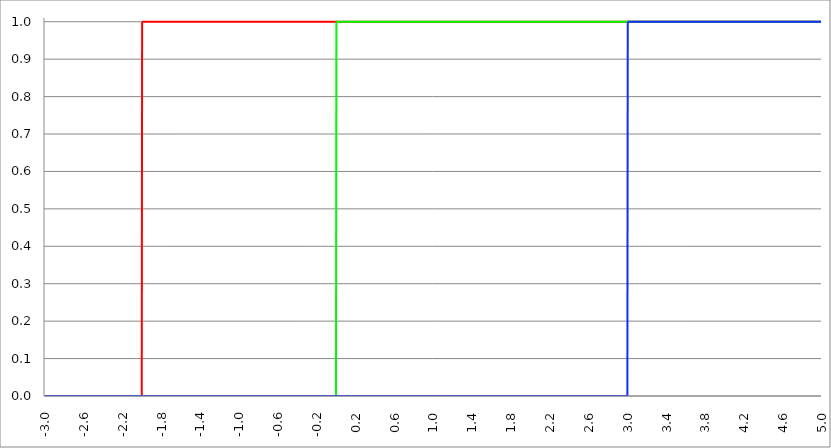
| Category | Series 1 | Series 0 | Series 2 |
|---|---|---|---|
| -3.0 | 0 | 0 | 0 |
| -2.996 | 0 | 0 | 0 |
| -2.992 | 0 | 0 | 0 |
| -2.988 | 0 | 0 | 0 |
| -2.984 | 0 | 0 | 0 |
| -2.98 | 0 | 0 | 0 |
| -2.976 | 0 | 0 | 0 |
| -2.972 | 0 | 0 | 0 |
| -2.968 | 0 | 0 | 0 |
| -2.964 | 0 | 0 | 0 |
| -2.96 | 0 | 0 | 0 |
| -2.956 | 0 | 0 | 0 |
| -2.952 | 0 | 0 | 0 |
| -2.948 | 0 | 0 | 0 |
| -2.944 | 0 | 0 | 0 |
| -2.94 | 0 | 0 | 0 |
| -2.936 | 0 | 0 | 0 |
| -2.932 | 0 | 0 | 0 |
| -2.928 | 0 | 0 | 0 |
| -2.924 | 0 | 0 | 0 |
| -2.92 | 0 | 0 | 0 |
| -2.916 | 0 | 0 | 0 |
| -2.912 | 0 | 0 | 0 |
| -2.908 | 0 | 0 | 0 |
| -2.904 | 0 | 0 | 0 |
| -2.9 | 0 | 0 | 0 |
| -2.896 | 0 | 0 | 0 |
| -2.892 | 0 | 0 | 0 |
| -2.888 | 0 | 0 | 0 |
| -2.884 | 0 | 0 | 0 |
| -2.88 | 0 | 0 | 0 |
| -2.876 | 0 | 0 | 0 |
| -2.872 | 0 | 0 | 0 |
| -2.868 | 0 | 0 | 0 |
| -2.864 | 0 | 0 | 0 |
| -2.86 | 0 | 0 | 0 |
| -2.856 | 0 | 0 | 0 |
| -2.852 | 0 | 0 | 0 |
| -2.848 | 0 | 0 | 0 |
| -2.844 | 0 | 0 | 0 |
| -2.84 | 0 | 0 | 0 |
| -2.836 | 0 | 0 | 0 |
| -2.832 | 0 | 0 | 0 |
| -2.828 | 0 | 0 | 0 |
| -2.824 | 0 | 0 | 0 |
| -2.82 | 0 | 0 | 0 |
| -2.816 | 0 | 0 | 0 |
| -2.812 | 0 | 0 | 0 |
| -2.808 | 0 | 0 | 0 |
| -2.804 | 0 | 0 | 0 |
| -2.8 | 0 | 0 | 0 |
| -2.796 | 0 | 0 | 0 |
| -2.792 | 0 | 0 | 0 |
| -2.788 | 0 | 0 | 0 |
| -2.784 | 0 | 0 | 0 |
| -2.78 | 0 | 0 | 0 |
| -2.776 | 0 | 0 | 0 |
| -2.772 | 0 | 0 | 0 |
| -2.768 | 0 | 0 | 0 |
| -2.764 | 0 | 0 | 0 |
| -2.76 | 0 | 0 | 0 |
| -2.756 | 0 | 0 | 0 |
| -2.752 | 0 | 0 | 0 |
| -2.748 | 0 | 0 | 0 |
| -2.744 | 0 | 0 | 0 |
| -2.74 | 0 | 0 | 0 |
| -2.736 | 0 | 0 | 0 |
| -2.732 | 0 | 0 | 0 |
| -2.728 | 0 | 0 | 0 |
| -2.724 | 0 | 0 | 0 |
| -2.72 | 0 | 0 | 0 |
| -2.716 | 0 | 0 | 0 |
| -2.712 | 0 | 0 | 0 |
| -2.708 | 0 | 0 | 0 |
| -2.704 | 0 | 0 | 0 |
| -2.7 | 0 | 0 | 0 |
| -2.696 | 0 | 0 | 0 |
| -2.692 | 0 | 0 | 0 |
| -2.688 | 0 | 0 | 0 |
| -2.684 | 0 | 0 | 0 |
| -2.68 | 0 | 0 | 0 |
| -2.676 | 0 | 0 | 0 |
| -2.672 | 0 | 0 | 0 |
| -2.668 | 0 | 0 | 0 |
| -2.664 | 0 | 0 | 0 |
| -2.66 | 0 | 0 | 0 |
| -2.656 | 0 | 0 | 0 |
| -2.652 | 0 | 0 | 0 |
| -2.648 | 0 | 0 | 0 |
| -2.644 | 0 | 0 | 0 |
| -2.64 | 0 | 0 | 0 |
| -2.636 | 0 | 0 | 0 |
| -2.632 | 0 | 0 | 0 |
| -2.628 | 0 | 0 | 0 |
| -2.624 | 0 | 0 | 0 |
| -2.62 | 0 | 0 | 0 |
| -2.616 | 0 | 0 | 0 |
| -2.612 | 0 | 0 | 0 |
| -2.608 | 0 | 0 | 0 |
| -2.604 | 0 | 0 | 0 |
| -2.6 | 0 | 0 | 0 |
| -2.596 | 0 | 0 | 0 |
| -2.592 | 0 | 0 | 0 |
| -2.588 | 0 | 0 | 0 |
| -2.584 | 0 | 0 | 0 |
| -2.58 | 0 | 0 | 0 |
| -2.576 | 0 | 0 | 0 |
| -2.572 | 0 | 0 | 0 |
| -2.568 | 0 | 0 | 0 |
| -2.564 | 0 | 0 | 0 |
| -2.56 | 0 | 0 | 0 |
| -2.556 | 0 | 0 | 0 |
| -2.552 | 0 | 0 | 0 |
| -2.548 | 0 | 0 | 0 |
| -2.544 | 0 | 0 | 0 |
| -2.54 | 0 | 0 | 0 |
| -2.536 | 0 | 0 | 0 |
| -2.532 | 0 | 0 | 0 |
| -2.528 | 0 | 0 | 0 |
| -2.524 | 0 | 0 | 0 |
| -2.52 | 0 | 0 | 0 |
| -2.516 | 0 | 0 | 0 |
| -2.512 | 0 | 0 | 0 |
| -2.508 | 0 | 0 | 0 |
| -2.504 | 0 | 0 | 0 |
| -2.5 | 0 | 0 | 0 |
| -2.496 | 0 | 0 | 0 |
| -2.492 | 0 | 0 | 0 |
| -2.488 | 0 | 0 | 0 |
| -2.484 | 0 | 0 | 0 |
| -2.48 | 0 | 0 | 0 |
| -2.476 | 0 | 0 | 0 |
| -2.472 | 0 | 0 | 0 |
| -2.467999999999999 | 0 | 0 | 0 |
| -2.463999999999999 | 0 | 0 | 0 |
| -2.459999999999999 | 0 | 0 | 0 |
| -2.455999999999999 | 0 | 0 | 0 |
| -2.451999999999999 | 0 | 0 | 0 |
| -2.447999999999999 | 0 | 0 | 0 |
| -2.443999999999999 | 0 | 0 | 0 |
| -2.439999999999999 | 0 | 0 | 0 |
| -2.435999999999999 | 0 | 0 | 0 |
| -2.431999999999999 | 0 | 0 | 0 |
| -2.427999999999999 | 0 | 0 | 0 |
| -2.423999999999999 | 0 | 0 | 0 |
| -2.419999999999999 | 0 | 0 | 0 |
| -2.415999999999999 | 0 | 0 | 0 |
| -2.411999999999999 | 0 | 0 | 0 |
| -2.407999999999999 | 0 | 0 | 0 |
| -2.403999999999999 | 0 | 0 | 0 |
| -2.399999999999999 | 0 | 0 | 0 |
| -2.395999999999999 | 0 | 0 | 0 |
| -2.391999999999999 | 0 | 0 | 0 |
| -2.387999999999999 | 0 | 0 | 0 |
| -2.383999999999999 | 0 | 0 | 0 |
| -2.379999999999999 | 0 | 0 | 0 |
| -2.375999999999999 | 0 | 0 | 0 |
| -2.371999999999999 | 0 | 0 | 0 |
| -2.367999999999999 | 0 | 0 | 0 |
| -2.363999999999999 | 0 | 0 | 0 |
| -2.359999999999999 | 0 | 0 | 0 |
| -2.355999999999999 | 0 | 0 | 0 |
| -2.351999999999999 | 0 | 0 | 0 |
| -2.347999999999999 | 0 | 0 | 0 |
| -2.343999999999999 | 0 | 0 | 0 |
| -2.339999999999999 | 0 | 0 | 0 |
| -2.335999999999999 | 0 | 0 | 0 |
| -2.331999999999999 | 0 | 0 | 0 |
| -2.327999999999999 | 0 | 0 | 0 |
| -2.323999999999999 | 0 | 0 | 0 |
| -2.319999999999999 | 0 | 0 | 0 |
| -2.315999999999999 | 0 | 0 | 0 |
| -2.311999999999999 | 0 | 0 | 0 |
| -2.307999999999999 | 0 | 0 | 0 |
| -2.303999999999999 | 0 | 0 | 0 |
| -2.299999999999999 | 0 | 0 | 0 |
| -2.295999999999999 | 0 | 0 | 0 |
| -2.291999999999999 | 0 | 0 | 0 |
| -2.288 | 0 | 0 | 0 |
| -2.284 | 0 | 0 | 0 |
| -2.279999999999999 | 0 | 0 | 0 |
| -2.275999999999999 | 0 | 0 | 0 |
| -2.271999999999999 | 0 | 0 | 0 |
| -2.268 | 0 | 0 | 0 |
| -2.264 | 0 | 0 | 0 |
| -2.259999999999999 | 0 | 0 | 0 |
| -2.255999999999999 | 0 | 0 | 0 |
| -2.251999999999999 | 0 | 0 | 0 |
| -2.248 | 0 | 0 | 0 |
| -2.244 | 0 | 0 | 0 |
| -2.239999999999999 | 0 | 0 | 0 |
| -2.235999999999999 | 0 | 0 | 0 |
| -2.231999999999999 | 0 | 0 | 0 |
| -2.228 | 0 | 0 | 0 |
| -2.224 | 0 | 0 | 0 |
| -2.219999999999999 | 0 | 0 | 0 |
| -2.215999999999999 | 0 | 0 | 0 |
| -2.211999999999999 | 0 | 0 | 0 |
| -2.208 | 0 | 0 | 0 |
| -2.204 | 0 | 0 | 0 |
| -2.199999999999999 | 0 | 0 | 0 |
| -2.195999999999999 | 0 | 0 | 0 |
| -2.191999999999999 | 0 | 0 | 0 |
| -2.188 | 0 | 0 | 0 |
| -2.184 | 0 | 0 | 0 |
| -2.179999999999999 | 0 | 0 | 0 |
| -2.175999999999999 | 0 | 0 | 0 |
| -2.171999999999999 | 0 | 0 | 0 |
| -2.168 | 0 | 0 | 0 |
| -2.164 | 0 | 0 | 0 |
| -2.159999999999999 | 0 | 0 | 0 |
| -2.155999999999999 | 0 | 0 | 0 |
| -2.151999999999999 | 0 | 0 | 0 |
| -2.148 | 0 | 0 | 0 |
| -2.144 | 0 | 0 | 0 |
| -2.139999999999999 | 0 | 0 | 0 |
| -2.135999999999999 | 0 | 0 | 0 |
| -2.131999999999999 | 0 | 0 | 0 |
| -2.128 | 0 | 0 | 0 |
| -2.124 | 0 | 0 | 0 |
| -2.119999999999999 | 0 | 0 | 0 |
| -2.115999999999999 | 0 | 0 | 0 |
| -2.111999999999999 | 0 | 0 | 0 |
| -2.108 | 0 | 0 | 0 |
| -2.104 | 0 | 0 | 0 |
| -2.099999999999999 | 0 | 0 | 0 |
| -2.095999999999999 | 0 | 0 | 0 |
| -2.091999999999999 | 0 | 0 | 0 |
| -2.088 | 0 | 0 | 0 |
| -2.084 | 0 | 0 | 0 |
| -2.079999999999999 | 0 | 0 | 0 |
| -2.075999999999999 | 0 | 0 | 0 |
| -2.071999999999999 | 0 | 0 | 0 |
| -2.068 | 0 | 0 | 0 |
| -2.064 | 0 | 0 | 0 |
| -2.059999999999999 | 0 | 0 | 0 |
| -2.055999999999999 | 0 | 0 | 0 |
| -2.051999999999999 | 0 | 0 | 0 |
| -2.048 | 0 | 0 | 0 |
| -2.044 | 0 | 0 | 0 |
| -2.039999999999999 | 0 | 0 | 0 |
| -2.035999999999999 | 0 | 0 | 0 |
| -2.031999999999999 | 0 | 0 | 0 |
| -2.028 | 0 | 0 | 0 |
| -2.024 | 0 | 0 | 0 |
| -2.019999999999999 | 0 | 0 | 0 |
| -2.015999999999999 | 0 | 0 | 0 |
| -2.011999999999999 | 0 | 0 | 0 |
| -2.008 | 0 | 0 | 0 |
| -2.004 | 0 | 0 | 0 |
| -1.999999999999999 | 1 | 0 | 0 |
| -1.995999999999999 | 1 | 0 | 0 |
| -1.991999999999999 | 1 | 0 | 0 |
| -1.987999999999999 | 1 | 0 | 0 |
| -1.983999999999999 | 1 | 0 | 0 |
| -1.979999999999999 | 1 | 0 | 0 |
| -1.975999999999999 | 1 | 0 | 0 |
| -1.971999999999999 | 1 | 0 | 0 |
| -1.967999999999999 | 1 | 0 | 0 |
| -1.963999999999999 | 1 | 0 | 0 |
| -1.959999999999999 | 1 | 0 | 0 |
| -1.955999999999999 | 1 | 0 | 0 |
| -1.951999999999999 | 1 | 0 | 0 |
| -1.947999999999999 | 1 | 0 | 0 |
| -1.943999999999999 | 1 | 0 | 0 |
| -1.939999999999999 | 1 | 0 | 0 |
| -1.935999999999999 | 1 | 0 | 0 |
| -1.931999999999999 | 1 | 0 | 0 |
| -1.927999999999999 | 1 | 0 | 0 |
| -1.923999999999999 | 1 | 0 | 0 |
| -1.919999999999999 | 1 | 0 | 0 |
| -1.915999999999999 | 1 | 0 | 0 |
| -1.911999999999999 | 1 | 0 | 0 |
| -1.907999999999999 | 1 | 0 | 0 |
| -1.903999999999999 | 1 | 0 | 0 |
| -1.899999999999999 | 1 | 0 | 0 |
| -1.895999999999999 | 1 | 0 | 0 |
| -1.891999999999999 | 1 | 0 | 0 |
| -1.887999999999999 | 1 | 0 | 0 |
| -1.883999999999999 | 1 | 0 | 0 |
| -1.879999999999999 | 1 | 0 | 0 |
| -1.875999999999999 | 1 | 0 | 0 |
| -1.871999999999999 | 1 | 0 | 0 |
| -1.867999999999999 | 1 | 0 | 0 |
| -1.863999999999999 | 1 | 0 | 0 |
| -1.859999999999999 | 1 | 0 | 0 |
| -1.855999999999999 | 1 | 0 | 0 |
| -1.851999999999999 | 1 | 0 | 0 |
| -1.847999999999999 | 1 | 0 | 0 |
| -1.843999999999999 | 1 | 0 | 0 |
| -1.839999999999999 | 1 | 0 | 0 |
| -1.835999999999999 | 1 | 0 | 0 |
| -1.831999999999999 | 1 | 0 | 0 |
| -1.827999999999999 | 1 | 0 | 0 |
| -1.823999999999999 | 1 | 0 | 0 |
| -1.819999999999999 | 1 | 0 | 0 |
| -1.815999999999999 | 1 | 0 | 0 |
| -1.811999999999999 | 1 | 0 | 0 |
| -1.807999999999999 | 1 | 0 | 0 |
| -1.803999999999999 | 1 | 0 | 0 |
| -1.799999999999999 | 1 | 0 | 0 |
| -1.795999999999999 | 1 | 0 | 0 |
| -1.791999999999999 | 1 | 0 | 0 |
| -1.787999999999999 | 1 | 0 | 0 |
| -1.783999999999999 | 1 | 0 | 0 |
| -1.779999999999999 | 1 | 0 | 0 |
| -1.775999999999999 | 1 | 0 | 0 |
| -1.771999999999999 | 1 | 0 | 0 |
| -1.767999999999999 | 1 | 0 | 0 |
| -1.763999999999999 | 1 | 0 | 0 |
| -1.759999999999999 | 1 | 0 | 0 |
| -1.755999999999999 | 1 | 0 | 0 |
| -1.751999999999999 | 1 | 0 | 0 |
| -1.747999999999999 | 1 | 0 | 0 |
| -1.743999999999999 | 1 | 0 | 0 |
| -1.739999999999999 | 1 | 0 | 0 |
| -1.735999999999999 | 1 | 0 | 0 |
| -1.731999999999999 | 1 | 0 | 0 |
| -1.727999999999999 | 1 | 0 | 0 |
| -1.723999999999999 | 1 | 0 | 0 |
| -1.719999999999999 | 1 | 0 | 0 |
| -1.715999999999999 | 1 | 0 | 0 |
| -1.711999999999999 | 1 | 0 | 0 |
| -1.707999999999999 | 1 | 0 | 0 |
| -1.703999999999999 | 1 | 0 | 0 |
| -1.699999999999999 | 1 | 0 | 0 |
| -1.695999999999999 | 1 | 0 | 0 |
| -1.691999999999999 | 1 | 0 | 0 |
| -1.687999999999999 | 1 | 0 | 0 |
| -1.683999999999999 | 1 | 0 | 0 |
| -1.679999999999999 | 1 | 0 | 0 |
| -1.675999999999999 | 1 | 0 | 0 |
| -1.671999999999999 | 1 | 0 | 0 |
| -1.667999999999999 | 1 | 0 | 0 |
| -1.663999999999999 | 1 | 0 | 0 |
| -1.659999999999999 | 1 | 0 | 0 |
| -1.655999999999999 | 1 | 0 | 0 |
| -1.651999999999999 | 1 | 0 | 0 |
| -1.647999999999999 | 1 | 0 | 0 |
| -1.643999999999999 | 1 | 0 | 0 |
| -1.639999999999999 | 1 | 0 | 0 |
| -1.635999999999999 | 1 | 0 | 0 |
| -1.631999999999999 | 1 | 0 | 0 |
| -1.627999999999999 | 1 | 0 | 0 |
| -1.623999999999999 | 1 | 0 | 0 |
| -1.619999999999999 | 1 | 0 | 0 |
| -1.615999999999999 | 1 | 0 | 0 |
| -1.611999999999999 | 1 | 0 | 0 |
| -1.607999999999999 | 1 | 0 | 0 |
| -1.603999999999999 | 1 | 0 | 0 |
| -1.599999999999999 | 1 | 0 | 0 |
| -1.595999999999999 | 1 | 0 | 0 |
| -1.591999999999999 | 1 | 0 | 0 |
| -1.587999999999999 | 1 | 0 | 0 |
| -1.583999999999999 | 1 | 0 | 0 |
| -1.579999999999999 | 1 | 0 | 0 |
| -1.575999999999999 | 1 | 0 | 0 |
| -1.571999999999999 | 1 | 0 | 0 |
| -1.567999999999999 | 1 | 0 | 0 |
| -1.563999999999999 | 1 | 0 | 0 |
| -1.559999999999999 | 1 | 0 | 0 |
| -1.555999999999999 | 1 | 0 | 0 |
| -1.551999999999999 | 1 | 0 | 0 |
| -1.547999999999999 | 1 | 0 | 0 |
| -1.543999999999999 | 1 | 0 | 0 |
| -1.539999999999999 | 1 | 0 | 0 |
| -1.535999999999999 | 1 | 0 | 0 |
| -1.531999999999999 | 1 | 0 | 0 |
| -1.527999999999999 | 1 | 0 | 0 |
| -1.523999999999999 | 1 | 0 | 0 |
| -1.519999999999999 | 1 | 0 | 0 |
| -1.515999999999999 | 1 | 0 | 0 |
| -1.511999999999999 | 1 | 0 | 0 |
| -1.507999999999999 | 1 | 0 | 0 |
| -1.503999999999999 | 1 | 0 | 0 |
| -1.499999999999999 | 1 | 0 | 0 |
| -1.495999999999999 | 1 | 0 | 0 |
| -1.491999999999999 | 1 | 0 | 0 |
| -1.487999999999999 | 1 | 0 | 0 |
| -1.483999999999999 | 1 | 0 | 0 |
| -1.479999999999999 | 1 | 0 | 0 |
| -1.475999999999999 | 1 | 0 | 0 |
| -1.471999999999999 | 1 | 0 | 0 |
| -1.467999999999999 | 1 | 0 | 0 |
| -1.463999999999999 | 1 | 0 | 0 |
| -1.459999999999999 | 1 | 0 | 0 |
| -1.455999999999999 | 1 | 0 | 0 |
| -1.451999999999999 | 1 | 0 | 0 |
| -1.447999999999999 | 1 | 0 | 0 |
| -1.443999999999999 | 1 | 0 | 0 |
| -1.439999999999999 | 1 | 0 | 0 |
| -1.435999999999999 | 1 | 0 | 0 |
| -1.431999999999999 | 1 | 0 | 0 |
| -1.427999999999999 | 1 | 0 | 0 |
| -1.423999999999999 | 1 | 0 | 0 |
| -1.419999999999999 | 1 | 0 | 0 |
| -1.415999999999999 | 1 | 0 | 0 |
| -1.411999999999999 | 1 | 0 | 0 |
| -1.407999999999999 | 1 | 0 | 0 |
| -1.403999999999999 | 1 | 0 | 0 |
| -1.399999999999999 | 1 | 0 | 0 |
| -1.395999999999999 | 1 | 0 | 0 |
| -1.391999999999999 | 1 | 0 | 0 |
| -1.387999999999999 | 1 | 0 | 0 |
| -1.383999999999999 | 1 | 0 | 0 |
| -1.379999999999999 | 1 | 0 | 0 |
| -1.375999999999999 | 1 | 0 | 0 |
| -1.371999999999999 | 1 | 0 | 0 |
| -1.367999999999998 | 1 | 0 | 0 |
| -1.363999999999998 | 1 | 0 | 0 |
| -1.359999999999998 | 1 | 0 | 0 |
| -1.355999999999998 | 1 | 0 | 0 |
| -1.351999999999998 | 1 | 0 | 0 |
| -1.347999999999998 | 1 | 0 | 0 |
| -1.343999999999998 | 1 | 0 | 0 |
| -1.339999999999998 | 1 | 0 | 0 |
| -1.335999999999998 | 1 | 0 | 0 |
| -1.331999999999998 | 1 | 0 | 0 |
| -1.327999999999998 | 1 | 0 | 0 |
| -1.323999999999998 | 1 | 0 | 0 |
| -1.319999999999998 | 1 | 0 | 0 |
| -1.315999999999998 | 1 | 0 | 0 |
| -1.311999999999998 | 1 | 0 | 0 |
| -1.307999999999998 | 1 | 0 | 0 |
| -1.303999999999998 | 1 | 0 | 0 |
| -1.299999999999998 | 1 | 0 | 0 |
| -1.295999999999998 | 1 | 0 | 0 |
| -1.291999999999998 | 1 | 0 | 0 |
| -1.287999999999998 | 1 | 0 | 0 |
| -1.283999999999998 | 1 | 0 | 0 |
| -1.279999999999998 | 1 | 0 | 0 |
| -1.275999999999998 | 1 | 0 | 0 |
| -1.271999999999998 | 1 | 0 | 0 |
| -1.267999999999998 | 1 | 0 | 0 |
| -1.263999999999998 | 1 | 0 | 0 |
| -1.259999999999998 | 1 | 0 | 0 |
| -1.255999999999998 | 1 | 0 | 0 |
| -1.251999999999998 | 1 | 0 | 0 |
| -1.247999999999998 | 1 | 0 | 0 |
| -1.243999999999998 | 1 | 0 | 0 |
| -1.239999999999998 | 1 | 0 | 0 |
| -1.235999999999998 | 1 | 0 | 0 |
| -1.231999999999998 | 1 | 0 | 0 |
| -1.227999999999998 | 1 | 0 | 0 |
| -1.223999999999998 | 1 | 0 | 0 |
| -1.219999999999998 | 1 | 0 | 0 |
| -1.215999999999998 | 1 | 0 | 0 |
| -1.211999999999998 | 1 | 0 | 0 |
| -1.207999999999998 | 1 | 0 | 0 |
| -1.203999999999998 | 1 | 0 | 0 |
| -1.199999999999998 | 1 | 0 | 0 |
| -1.195999999999998 | 1 | 0 | 0 |
| -1.191999999999998 | 1 | 0 | 0 |
| -1.187999999999998 | 1 | 0 | 0 |
| -1.183999999999998 | 1 | 0 | 0 |
| -1.179999999999998 | 1 | 0 | 0 |
| -1.175999999999998 | 1 | 0 | 0 |
| -1.171999999999998 | 1 | 0 | 0 |
| -1.167999999999998 | 1 | 0 | 0 |
| -1.163999999999998 | 1 | 0 | 0 |
| -1.159999999999998 | 1 | 0 | 0 |
| -1.155999999999998 | 1 | 0 | 0 |
| -1.151999999999998 | 1 | 0 | 0 |
| -1.147999999999998 | 1 | 0 | 0 |
| -1.143999999999998 | 1 | 0 | 0 |
| -1.139999999999998 | 1 | 0 | 0 |
| -1.135999999999998 | 1 | 0 | 0 |
| -1.131999999999998 | 1 | 0 | 0 |
| -1.127999999999998 | 1 | 0 | 0 |
| -1.123999999999998 | 1 | 0 | 0 |
| -1.119999999999998 | 1 | 0 | 0 |
| -1.115999999999998 | 1 | 0 | 0 |
| -1.111999999999998 | 1 | 0 | 0 |
| -1.107999999999998 | 1 | 0 | 0 |
| -1.103999999999998 | 1 | 0 | 0 |
| -1.099999999999998 | 1 | 0 | 0 |
| -1.095999999999998 | 1 | 0 | 0 |
| -1.091999999999998 | 1 | 0 | 0 |
| -1.087999999999998 | 1 | 0 | 0 |
| -1.083999999999998 | 1 | 0 | 0 |
| -1.079999999999998 | 1 | 0 | 0 |
| -1.075999999999998 | 1 | 0 | 0 |
| -1.071999999999998 | 1 | 0 | 0 |
| -1.067999999999998 | 1 | 0 | 0 |
| -1.063999999999998 | 1 | 0 | 0 |
| -1.059999999999998 | 1 | 0 | 0 |
| -1.055999999999998 | 1 | 0 | 0 |
| -1.051999999999998 | 1 | 0 | 0 |
| -1.047999999999998 | 1 | 0 | 0 |
| -1.043999999999998 | 1 | 0 | 0 |
| -1.039999999999998 | 1 | 0 | 0 |
| -1.035999999999998 | 1 | 0 | 0 |
| -1.031999999999998 | 1 | 0 | 0 |
| -1.027999999999998 | 1 | 0 | 0 |
| -1.023999999999998 | 1 | 0 | 0 |
| -1.019999999999998 | 1 | 0 | 0 |
| -1.015999999999998 | 1 | 0 | 0 |
| -1.011999999999998 | 1 | 0 | 0 |
| -1.007999999999998 | 1 | 0 | 0 |
| -1.003999999999998 | 1 | 0 | 0 |
| -0.999999999999998 | 1 | 0 | 0 |
| -0.995999999999998 | 1 | 0 | 0 |
| -0.991999999999998 | 1 | 0 | 0 |
| -0.987999999999998 | 1 | 0 | 0 |
| -0.983999999999998 | 1 | 0 | 0 |
| -0.979999999999998 | 1 | 0 | 0 |
| -0.975999999999998 | 1 | 0 | 0 |
| -0.971999999999998 | 1 | 0 | 0 |
| -0.967999999999998 | 1 | 0 | 0 |
| -0.963999999999998 | 1 | 0 | 0 |
| -0.959999999999998 | 1 | 0 | 0 |
| -0.955999999999998 | 1 | 0 | 0 |
| -0.951999999999998 | 1 | 0 | 0 |
| -0.947999999999998 | 1 | 0 | 0 |
| -0.943999999999998 | 1 | 0 | 0 |
| -0.939999999999998 | 1 | 0 | 0 |
| -0.935999999999998 | 1 | 0 | 0 |
| -0.931999999999998 | 1 | 0 | 0 |
| -0.927999999999998 | 1 | 0 | 0 |
| -0.923999999999998 | 1 | 0 | 0 |
| -0.919999999999998 | 1 | 0 | 0 |
| -0.915999999999998 | 1 | 0 | 0 |
| -0.911999999999998 | 1 | 0 | 0 |
| -0.907999999999998 | 1 | 0 | 0 |
| -0.903999999999998 | 1 | 0 | 0 |
| -0.899999999999998 | 1 | 0 | 0 |
| -0.895999999999998 | 1 | 0 | 0 |
| -0.891999999999998 | 1 | 0 | 0 |
| -0.887999999999998 | 1 | 0 | 0 |
| -0.883999999999998 | 1 | 0 | 0 |
| -0.879999999999998 | 1 | 0 | 0 |
| -0.875999999999998 | 1 | 0 | 0 |
| -0.871999999999998 | 1 | 0 | 0 |
| -0.867999999999998 | 1 | 0 | 0 |
| -0.863999999999998 | 1 | 0 | 0 |
| -0.859999999999998 | 1 | 0 | 0 |
| -0.855999999999998 | 1 | 0 | 0 |
| -0.851999999999998 | 1 | 0 | 0 |
| -0.847999999999998 | 1 | 0 | 0 |
| -0.843999999999998 | 1 | 0 | 0 |
| -0.839999999999998 | 1 | 0 | 0 |
| -0.835999999999998 | 1 | 0 | 0 |
| -0.831999999999998 | 1 | 0 | 0 |
| -0.827999999999998 | 1 | 0 | 0 |
| -0.823999999999998 | 1 | 0 | 0 |
| -0.819999999999998 | 1 | 0 | 0 |
| -0.815999999999998 | 1 | 0 | 0 |
| -0.811999999999998 | 1 | 0 | 0 |
| -0.807999999999998 | 1 | 0 | 0 |
| -0.803999999999998 | 1 | 0 | 0 |
| -0.799999999999998 | 1 | 0 | 0 |
| -0.795999999999998 | 1 | 0 | 0 |
| -0.791999999999998 | 1 | 0 | 0 |
| -0.787999999999998 | 1 | 0 | 0 |
| -0.783999999999998 | 1 | 0 | 0 |
| -0.779999999999998 | 1 | 0 | 0 |
| -0.775999999999998 | 1 | 0 | 0 |
| -0.771999999999998 | 1 | 0 | 0 |
| -0.767999999999998 | 1 | 0 | 0 |
| -0.763999999999998 | 1 | 0 | 0 |
| -0.759999999999998 | 1 | 0 | 0 |
| -0.755999999999998 | 1 | 0 | 0 |
| -0.751999999999998 | 1 | 0 | 0 |
| -0.747999999999998 | 1 | 0 | 0 |
| -0.743999999999998 | 1 | 0 | 0 |
| -0.739999999999998 | 1 | 0 | 0 |
| -0.735999999999998 | 1 | 0 | 0 |
| -0.731999999999998 | 1 | 0 | 0 |
| -0.727999999999998 | 1 | 0 | 0 |
| -0.723999999999998 | 1 | 0 | 0 |
| -0.719999999999998 | 1 | 0 | 0 |
| -0.715999999999998 | 1 | 0 | 0 |
| -0.711999999999998 | 1 | 0 | 0 |
| -0.707999999999998 | 1 | 0 | 0 |
| -0.703999999999998 | 1 | 0 | 0 |
| -0.699999999999998 | 1 | 0 | 0 |
| -0.695999999999998 | 1 | 0 | 0 |
| -0.691999999999998 | 1 | 0 | 0 |
| -0.687999999999998 | 1 | 0 | 0 |
| -0.683999999999998 | 1 | 0 | 0 |
| -0.679999999999998 | 1 | 0 | 0 |
| -0.675999999999998 | 1 | 0 | 0 |
| -0.671999999999998 | 1 | 0 | 0 |
| -0.667999999999998 | 1 | 0 | 0 |
| -0.663999999999998 | 1 | 0 | 0 |
| -0.659999999999998 | 1 | 0 | 0 |
| -0.655999999999998 | 1 | 0 | 0 |
| -0.651999999999998 | 1 | 0 | 0 |
| -0.647999999999998 | 1 | 0 | 0 |
| -0.643999999999998 | 1 | 0 | 0 |
| -0.639999999999998 | 1 | 0 | 0 |
| -0.635999999999998 | 1 | 0 | 0 |
| -0.631999999999998 | 1 | 0 | 0 |
| -0.627999999999998 | 1 | 0 | 0 |
| -0.623999999999998 | 1 | 0 | 0 |
| -0.619999999999998 | 1 | 0 | 0 |
| -0.615999999999998 | 1 | 0 | 0 |
| -0.611999999999998 | 1 | 0 | 0 |
| -0.607999999999998 | 1 | 0 | 0 |
| -0.603999999999998 | 1 | 0 | 0 |
| -0.599999999999998 | 1 | 0 | 0 |
| -0.595999999999998 | 1 | 0 | 0 |
| -0.591999999999998 | 1 | 0 | 0 |
| -0.587999999999998 | 1 | 0 | 0 |
| -0.583999999999998 | 1 | 0 | 0 |
| -0.579999999999998 | 1 | 0 | 0 |
| -0.575999999999998 | 1 | 0 | 0 |
| -0.571999999999998 | 1 | 0 | 0 |
| -0.567999999999998 | 1 | 0 | 0 |
| -0.563999999999998 | 1 | 0 | 0 |
| -0.559999999999998 | 1 | 0 | 0 |
| -0.555999999999998 | 1 | 0 | 0 |
| -0.551999999999998 | 1 | 0 | 0 |
| -0.547999999999998 | 1 | 0 | 0 |
| -0.543999999999998 | 1 | 0 | 0 |
| -0.539999999999998 | 1 | 0 | 0 |
| -0.535999999999998 | 1 | 0 | 0 |
| -0.531999999999998 | 1 | 0 | 0 |
| -0.527999999999998 | 1 | 0 | 0 |
| -0.523999999999998 | 1 | 0 | 0 |
| -0.519999999999998 | 1 | 0 | 0 |
| -0.515999999999998 | 1 | 0 | 0 |
| -0.511999999999998 | 1 | 0 | 0 |
| -0.507999999999998 | 1 | 0 | 0 |
| -0.503999999999998 | 1 | 0 | 0 |
| -0.499999999999998 | 1 | 0 | 0 |
| -0.495999999999998 | 1 | 0 | 0 |
| -0.491999999999998 | 1 | 0 | 0 |
| -0.487999999999998 | 1 | 0 | 0 |
| -0.483999999999998 | 1 | 0 | 0 |
| -0.479999999999998 | 1 | 0 | 0 |
| -0.475999999999998 | 1 | 0 | 0 |
| -0.471999999999998 | 1 | 0 | 0 |
| -0.467999999999998 | 1 | 0 | 0 |
| -0.463999999999998 | 1 | 0 | 0 |
| -0.459999999999998 | 1 | 0 | 0 |
| -0.455999999999998 | 1 | 0 | 0 |
| -0.451999999999998 | 1 | 0 | 0 |
| -0.447999999999998 | 1 | 0 | 0 |
| -0.443999999999998 | 1 | 0 | 0 |
| -0.439999999999998 | 1 | 0 | 0 |
| -0.435999999999998 | 1 | 0 | 0 |
| -0.431999999999998 | 1 | 0 | 0 |
| -0.427999999999998 | 1 | 0 | 0 |
| -0.423999999999998 | 1 | 0 | 0 |
| -0.419999999999998 | 1 | 0 | 0 |
| -0.415999999999998 | 1 | 0 | 0 |
| -0.411999999999998 | 1 | 0 | 0 |
| -0.407999999999998 | 1 | 0 | 0 |
| -0.403999999999998 | 1 | 0 | 0 |
| -0.399999999999998 | 1 | 0 | 0 |
| -0.395999999999998 | 1 | 0 | 0 |
| -0.391999999999998 | 1 | 0 | 0 |
| -0.387999999999998 | 1 | 0 | 0 |
| -0.383999999999998 | 1 | 0 | 0 |
| -0.379999999999998 | 1 | 0 | 0 |
| -0.375999999999998 | 1 | 0 | 0 |
| -0.371999999999998 | 1 | 0 | 0 |
| -0.367999999999998 | 1 | 0 | 0 |
| -0.363999999999998 | 1 | 0 | 0 |
| -0.359999999999998 | 1 | 0 | 0 |
| -0.355999999999998 | 1 | 0 | 0 |
| -0.351999999999998 | 1 | 0 | 0 |
| -0.347999999999998 | 1 | 0 | 0 |
| -0.343999999999998 | 1 | 0 | 0 |
| -0.339999999999998 | 1 | 0 | 0 |
| -0.335999999999998 | 1 | 0 | 0 |
| -0.331999999999998 | 1 | 0 | 0 |
| -0.327999999999998 | 1 | 0 | 0 |
| -0.323999999999998 | 1 | 0 | 0 |
| -0.319999999999998 | 1 | 0 | 0 |
| -0.315999999999998 | 1 | 0 | 0 |
| -0.311999999999998 | 1 | 0 | 0 |
| -0.307999999999998 | 1 | 0 | 0 |
| -0.303999999999998 | 1 | 0 | 0 |
| -0.299999999999998 | 1 | 0 | 0 |
| -0.295999999999998 | 1 | 0 | 0 |
| -0.291999999999998 | 1 | 0 | 0 |
| -0.287999999999998 | 1 | 0 | 0 |
| -0.283999999999998 | 1 | 0 | 0 |
| -0.279999999999998 | 1 | 0 | 0 |
| -0.275999999999998 | 1 | 0 | 0 |
| -0.271999999999998 | 1 | 0 | 0 |
| -0.267999999999998 | 1 | 0 | 0 |
| -0.263999999999998 | 1 | 0 | 0 |
| -0.259999999999998 | 1 | 0 | 0 |
| -0.255999999999998 | 1 | 0 | 0 |
| -0.251999999999998 | 1 | 0 | 0 |
| -0.247999999999998 | 1 | 0 | 0 |
| -0.243999999999998 | 1 | 0 | 0 |
| -0.239999999999998 | 1 | 0 | 0 |
| -0.235999999999998 | 1 | 0 | 0 |
| -0.231999999999998 | 1 | 0 | 0 |
| -0.227999999999998 | 1 | 0 | 0 |
| -0.223999999999998 | 1 | 0 | 0 |
| -0.219999999999998 | 1 | 0 | 0 |
| -0.215999999999998 | 1 | 0 | 0 |
| -0.211999999999998 | 1 | 0 | 0 |
| -0.207999999999998 | 1 | 0 | 0 |
| -0.203999999999998 | 1 | 0 | 0 |
| -0.199999999999997 | 1 | 0 | 0 |
| -0.195999999999997 | 1 | 0 | 0 |
| -0.191999999999997 | 1 | 0 | 0 |
| -0.187999999999997 | 1 | 0 | 0 |
| -0.183999999999997 | 1 | 0 | 0 |
| -0.179999999999997 | 1 | 0 | 0 |
| -0.175999999999997 | 1 | 0 | 0 |
| -0.171999999999997 | 1 | 0 | 0 |
| -0.167999999999997 | 1 | 0 | 0 |
| -0.163999999999997 | 1 | 0 | 0 |
| -0.159999999999997 | 1 | 0 | 0 |
| -0.155999999999997 | 1 | 0 | 0 |
| -0.151999999999997 | 1 | 0 | 0 |
| -0.147999999999997 | 1 | 0 | 0 |
| -0.143999999999997 | 1 | 0 | 0 |
| -0.139999999999997 | 1 | 0 | 0 |
| -0.135999999999997 | 1 | 0 | 0 |
| -0.131999999999997 | 1 | 0 | 0 |
| -0.127999999999997 | 1 | 0 | 0 |
| -0.123999999999997 | 1 | 0 | 0 |
| -0.119999999999997 | 1 | 0 | 0 |
| -0.115999999999997 | 1 | 0 | 0 |
| -0.111999999999997 | 1 | 0 | 0 |
| -0.107999999999997 | 1 | 0 | 0 |
| -0.103999999999997 | 1 | 0 | 0 |
| -0.0999999999999974 | 1 | 0 | 0 |
| -0.0959999999999974 | 1 | 0 | 0 |
| -0.0919999999999974 | 1 | 0 | 0 |
| -0.0879999999999974 | 1 | 0 | 0 |
| -0.0839999999999974 | 1 | 0 | 0 |
| -0.0799999999999974 | 1 | 0 | 0 |
| -0.0759999999999974 | 1 | 0 | 0 |
| -0.0719999999999974 | 1 | 0 | 0 |
| -0.0679999999999974 | 1 | 0 | 0 |
| -0.0639999999999974 | 1 | 0 | 0 |
| -0.0599999999999974 | 1 | 0 | 0 |
| -0.0559999999999974 | 1 | 0 | 0 |
| -0.0519999999999974 | 1 | 0 | 0 |
| -0.0479999999999974 | 1 | 0 | 0 |
| -0.0439999999999974 | 1 | 0 | 0 |
| -0.0399999999999974 | 1 | 0 | 0 |
| -0.0359999999999974 | 1 | 0 | 0 |
| -0.0319999999999974 | 1 | 0 | 0 |
| -0.0279999999999974 | 1 | 0 | 0 |
| -0.0239999999999974 | 1 | 0 | 0 |
| -0.0199999999999974 | 1 | 0 | 0 |
| -0.0159999999999974 | 1 | 0 | 0 |
| -0.0119999999999974 | 1 | 0 | 0 |
| -0.00799999999999736 | 1 | 0 | 0 |
| -0.00399999999999736 | 1 | 0 | 0 |
| 2.63677968348475e-15 | 1 | 1 | 0 |
| 0.00400000000000264 | 1 | 1 | 0 |
| 0.00800000000000264 | 1 | 1 | 0 |
| 0.0120000000000026 | 1 | 1 | 0 |
| 0.0160000000000026 | 1 | 1 | 0 |
| 0.0200000000000026 | 1 | 1 | 0 |
| 0.0240000000000026 | 1 | 1 | 0 |
| 0.0280000000000026 | 1 | 1 | 0 |
| 0.0320000000000026 | 1 | 1 | 0 |
| 0.0360000000000026 | 1 | 1 | 0 |
| 0.0400000000000026 | 1 | 1 | 0 |
| 0.0440000000000026 | 1 | 1 | 0 |
| 0.0480000000000026 | 1 | 1 | 0 |
| 0.0520000000000026 | 1 | 1 | 0 |
| 0.0560000000000026 | 1 | 1 | 0 |
| 0.0600000000000027 | 1 | 1 | 0 |
| 0.0640000000000027 | 1 | 1 | 0 |
| 0.0680000000000027 | 1 | 1 | 0 |
| 0.0720000000000027 | 1 | 1 | 0 |
| 0.0760000000000027 | 1 | 1 | 0 |
| 0.0800000000000027 | 1 | 1 | 0 |
| 0.0840000000000027 | 1 | 1 | 0 |
| 0.0880000000000027 | 1 | 1 | 0 |
| 0.0920000000000027 | 1 | 1 | 0 |
| 0.0960000000000027 | 1 | 1 | 0 |
| 0.100000000000003 | 1 | 1 | 0 |
| 0.104000000000003 | 1 | 1 | 0 |
| 0.108000000000003 | 1 | 1 | 0 |
| 0.112000000000003 | 1 | 1 | 0 |
| 0.116000000000003 | 1 | 1 | 0 |
| 0.120000000000003 | 1 | 1 | 0 |
| 0.124000000000003 | 1 | 1 | 0 |
| 0.128000000000003 | 1 | 1 | 0 |
| 0.132000000000003 | 1 | 1 | 0 |
| 0.136000000000003 | 1 | 1 | 0 |
| 0.140000000000003 | 1 | 1 | 0 |
| 0.144000000000003 | 1 | 1 | 0 |
| 0.148000000000003 | 1 | 1 | 0 |
| 0.152000000000003 | 1 | 1 | 0 |
| 0.156000000000003 | 1 | 1 | 0 |
| 0.160000000000003 | 1 | 1 | 0 |
| 0.164000000000003 | 1 | 1 | 0 |
| 0.168000000000003 | 1 | 1 | 0 |
| 0.172000000000003 | 1 | 1 | 0 |
| 0.176000000000003 | 1 | 1 | 0 |
| 0.180000000000003 | 1 | 1 | 0 |
| 0.184000000000003 | 1 | 1 | 0 |
| 0.188000000000003 | 1 | 1 | 0 |
| 0.192000000000003 | 1 | 1 | 0 |
| 0.196000000000003 | 1 | 1 | 0 |
| 0.200000000000003 | 1 | 1 | 0 |
| 0.204000000000003 | 1 | 1 | 0 |
| 0.208000000000003 | 1 | 1 | 0 |
| 0.212000000000003 | 1 | 1 | 0 |
| 0.216000000000003 | 1 | 1 | 0 |
| 0.220000000000003 | 1 | 1 | 0 |
| 0.224000000000003 | 1 | 1 | 0 |
| 0.228000000000003 | 1 | 1 | 0 |
| 0.232000000000003 | 1 | 1 | 0 |
| 0.236000000000003 | 1 | 1 | 0 |
| 0.240000000000003 | 1 | 1 | 0 |
| 0.244000000000003 | 1 | 1 | 0 |
| 0.248000000000003 | 1 | 1 | 0 |
| 0.252000000000003 | 1 | 1 | 0 |
| 0.256000000000003 | 1 | 1 | 0 |
| 0.260000000000003 | 1 | 1 | 0 |
| 0.264000000000003 | 1 | 1 | 0 |
| 0.268000000000003 | 1 | 1 | 0 |
| 0.272000000000003 | 1 | 1 | 0 |
| 0.276000000000003 | 1 | 1 | 0 |
| 0.280000000000003 | 1 | 1 | 0 |
| 0.284000000000003 | 1 | 1 | 0 |
| 0.288000000000003 | 1 | 1 | 0 |
| 0.292000000000003 | 1 | 1 | 0 |
| 0.296000000000003 | 1 | 1 | 0 |
| 0.300000000000003 | 1 | 1 | 0 |
| 0.304000000000003 | 1 | 1 | 0 |
| 0.308000000000003 | 1 | 1 | 0 |
| 0.312000000000003 | 1 | 1 | 0 |
| 0.316000000000003 | 1 | 1 | 0 |
| 0.320000000000003 | 1 | 1 | 0 |
| 0.324000000000003 | 1 | 1 | 0 |
| 0.328000000000003 | 1 | 1 | 0 |
| 0.332000000000003 | 1 | 1 | 0 |
| 0.336000000000003 | 1 | 1 | 0 |
| 0.340000000000003 | 1 | 1 | 0 |
| 0.344000000000003 | 1 | 1 | 0 |
| 0.348000000000003 | 1 | 1 | 0 |
| 0.352000000000003 | 1 | 1 | 0 |
| 0.356000000000003 | 1 | 1 | 0 |
| 0.360000000000003 | 1 | 1 | 0 |
| 0.364000000000003 | 1 | 1 | 0 |
| 0.368000000000003 | 1 | 1 | 0 |
| 0.372000000000003 | 1 | 1 | 0 |
| 0.376000000000003 | 1 | 1 | 0 |
| 0.380000000000003 | 1 | 1 | 0 |
| 0.384000000000003 | 1 | 1 | 0 |
| 0.388000000000003 | 1 | 1 | 0 |
| 0.392000000000003 | 1 | 1 | 0 |
| 0.396000000000003 | 1 | 1 | 0 |
| 0.400000000000003 | 1 | 1 | 0 |
| 0.404000000000003 | 1 | 1 | 0 |
| 0.408000000000003 | 1 | 1 | 0 |
| 0.412000000000003 | 1 | 1 | 0 |
| 0.416000000000003 | 1 | 1 | 0 |
| 0.420000000000003 | 1 | 1 | 0 |
| 0.424000000000003 | 1 | 1 | 0 |
| 0.428000000000003 | 1 | 1 | 0 |
| 0.432000000000003 | 1 | 1 | 0 |
| 0.436000000000003 | 1 | 1 | 0 |
| 0.440000000000003 | 1 | 1 | 0 |
| 0.444000000000003 | 1 | 1 | 0 |
| 0.448000000000003 | 1 | 1 | 0 |
| 0.452000000000003 | 1 | 1 | 0 |
| 0.456000000000003 | 1 | 1 | 0 |
| 0.460000000000003 | 1 | 1 | 0 |
| 0.464000000000003 | 1 | 1 | 0 |
| 0.468000000000003 | 1 | 1 | 0 |
| 0.472000000000003 | 1 | 1 | 0 |
| 0.476000000000003 | 1 | 1 | 0 |
| 0.480000000000003 | 1 | 1 | 0 |
| 0.484000000000003 | 1 | 1 | 0 |
| 0.488000000000003 | 1 | 1 | 0 |
| 0.492000000000003 | 1 | 1 | 0 |
| 0.496000000000003 | 1 | 1 | 0 |
| 0.500000000000003 | 1 | 1 | 0 |
| 0.504000000000003 | 1 | 1 | 0 |
| 0.508000000000003 | 1 | 1 | 0 |
| 0.512000000000003 | 1 | 1 | 0 |
| 0.516000000000003 | 1 | 1 | 0 |
| 0.520000000000003 | 1 | 1 | 0 |
| 0.524000000000003 | 1 | 1 | 0 |
| 0.528000000000003 | 1 | 1 | 0 |
| 0.532000000000003 | 1 | 1 | 0 |
| 0.536000000000003 | 1 | 1 | 0 |
| 0.540000000000003 | 1 | 1 | 0 |
| 0.544000000000003 | 1 | 1 | 0 |
| 0.548000000000003 | 1 | 1 | 0 |
| 0.552000000000003 | 1 | 1 | 0 |
| 0.556000000000003 | 1 | 1 | 0 |
| 0.560000000000003 | 1 | 1 | 0 |
| 0.564000000000003 | 1 | 1 | 0 |
| 0.568000000000003 | 1 | 1 | 0 |
| 0.572000000000003 | 1 | 1 | 0 |
| 0.576000000000003 | 1 | 1 | 0 |
| 0.580000000000003 | 1 | 1 | 0 |
| 0.584000000000003 | 1 | 1 | 0 |
| 0.588000000000003 | 1 | 1 | 0 |
| 0.592000000000003 | 1 | 1 | 0 |
| 0.596000000000003 | 1 | 1 | 0 |
| 0.600000000000003 | 1 | 1 | 0 |
| 0.604000000000003 | 1 | 1 | 0 |
| 0.608000000000003 | 1 | 1 | 0 |
| 0.612000000000003 | 1 | 1 | 0 |
| 0.616000000000003 | 1 | 1 | 0 |
| 0.620000000000003 | 1 | 1 | 0 |
| 0.624000000000003 | 1 | 1 | 0 |
| 0.628000000000003 | 1 | 1 | 0 |
| 0.632000000000003 | 1 | 1 | 0 |
| 0.636000000000003 | 1 | 1 | 0 |
| 0.640000000000003 | 1 | 1 | 0 |
| 0.644000000000003 | 1 | 1 | 0 |
| 0.648000000000003 | 1 | 1 | 0 |
| 0.652000000000003 | 1 | 1 | 0 |
| 0.656000000000003 | 1 | 1 | 0 |
| 0.660000000000003 | 1 | 1 | 0 |
| 0.664000000000003 | 1 | 1 | 0 |
| 0.668000000000003 | 1 | 1 | 0 |
| 0.672000000000003 | 1 | 1 | 0 |
| 0.676000000000003 | 1 | 1 | 0 |
| 0.680000000000003 | 1 | 1 | 0 |
| 0.684000000000003 | 1 | 1 | 0 |
| 0.688000000000003 | 1 | 1 | 0 |
| 0.692000000000003 | 1 | 1 | 0 |
| 0.696000000000003 | 1 | 1 | 0 |
| 0.700000000000003 | 1 | 1 | 0 |
| 0.704000000000003 | 1 | 1 | 0 |
| 0.708000000000003 | 1 | 1 | 0 |
| 0.712000000000003 | 1 | 1 | 0 |
| 0.716000000000003 | 1 | 1 | 0 |
| 0.720000000000003 | 1 | 1 | 0 |
| 0.724000000000003 | 1 | 1 | 0 |
| 0.728000000000003 | 1 | 1 | 0 |
| 0.732000000000003 | 1 | 1 | 0 |
| 0.736000000000003 | 1 | 1 | 0 |
| 0.740000000000003 | 1 | 1 | 0 |
| 0.744000000000003 | 1 | 1 | 0 |
| 0.748000000000003 | 1 | 1 | 0 |
| 0.752000000000003 | 1 | 1 | 0 |
| 0.756000000000003 | 1 | 1 | 0 |
| 0.760000000000003 | 1 | 1 | 0 |
| 0.764000000000003 | 1 | 1 | 0 |
| 0.768000000000003 | 1 | 1 | 0 |
| 0.772000000000003 | 1 | 1 | 0 |
| 0.776000000000003 | 1 | 1 | 0 |
| 0.780000000000003 | 1 | 1 | 0 |
| 0.784000000000003 | 1 | 1 | 0 |
| 0.788000000000003 | 1 | 1 | 0 |
| 0.792000000000003 | 1 | 1 | 0 |
| 0.796000000000003 | 1 | 1 | 0 |
| 0.800000000000003 | 1 | 1 | 0 |
| 0.804000000000003 | 1 | 1 | 0 |
| 0.808000000000003 | 1 | 1 | 0 |
| 0.812000000000003 | 1 | 1 | 0 |
| 0.816000000000003 | 1 | 1 | 0 |
| 0.820000000000003 | 1 | 1 | 0 |
| 0.824000000000003 | 1 | 1 | 0 |
| 0.828000000000003 | 1 | 1 | 0 |
| 0.832000000000003 | 1 | 1 | 0 |
| 0.836000000000003 | 1 | 1 | 0 |
| 0.840000000000003 | 1 | 1 | 0 |
| 0.844000000000003 | 1 | 1 | 0 |
| 0.848000000000003 | 1 | 1 | 0 |
| 0.852000000000003 | 1 | 1 | 0 |
| 0.856000000000003 | 1 | 1 | 0 |
| 0.860000000000003 | 1 | 1 | 0 |
| 0.864000000000003 | 1 | 1 | 0 |
| 0.868000000000003 | 1 | 1 | 0 |
| 0.872000000000003 | 1 | 1 | 0 |
| 0.876000000000003 | 1 | 1 | 0 |
| 0.880000000000003 | 1 | 1 | 0 |
| 0.884000000000003 | 1 | 1 | 0 |
| 0.888000000000003 | 1 | 1 | 0 |
| 0.892000000000003 | 1 | 1 | 0 |
| 0.896000000000003 | 1 | 1 | 0 |
| 0.900000000000003 | 1 | 1 | 0 |
| 0.904000000000003 | 1 | 1 | 0 |
| 0.908000000000003 | 1 | 1 | 0 |
| 0.912000000000003 | 1 | 1 | 0 |
| 0.916000000000003 | 1 | 1 | 0 |
| 0.920000000000003 | 1 | 1 | 0 |
| 0.924000000000003 | 1 | 1 | 0 |
| 0.928000000000003 | 1 | 1 | 0 |
| 0.932000000000003 | 1 | 1 | 0 |
| 0.936000000000003 | 1 | 1 | 0 |
| 0.940000000000003 | 1 | 1 | 0 |
| 0.944000000000003 | 1 | 1 | 0 |
| 0.948000000000003 | 1 | 1 | 0 |
| 0.952000000000003 | 1 | 1 | 0 |
| 0.956000000000003 | 1 | 1 | 0 |
| 0.960000000000003 | 1 | 1 | 0 |
| 0.964000000000003 | 1 | 1 | 0 |
| 0.968000000000003 | 1 | 1 | 0 |
| 0.972000000000003 | 1 | 1 | 0 |
| 0.976000000000003 | 1 | 1 | 0 |
| 0.980000000000003 | 1 | 1 | 0 |
| 0.984000000000003 | 1 | 1 | 0 |
| 0.988000000000003 | 1 | 1 | 0 |
| 0.992000000000003 | 1 | 1 | 0 |
| 0.996000000000003 | 1 | 1 | 0 |
| 1.000000000000003 | 1 | 1 | 0 |
| 1.004000000000003 | 1 | 1 | 0 |
| 1.008000000000003 | 1 | 1 | 0 |
| 1.012000000000003 | 1 | 1 | 0 |
| 1.016000000000003 | 1 | 1 | 0 |
| 1.020000000000003 | 1 | 1 | 0 |
| 1.024000000000003 | 1 | 1 | 0 |
| 1.028000000000003 | 1 | 1 | 0 |
| 1.032000000000003 | 1 | 1 | 0 |
| 1.036000000000003 | 1 | 1 | 0 |
| 1.040000000000003 | 1 | 1 | 0 |
| 1.044000000000003 | 1 | 1 | 0 |
| 1.048000000000003 | 1 | 1 | 0 |
| 1.052000000000003 | 1 | 1 | 0 |
| 1.056000000000003 | 1 | 1 | 0 |
| 1.060000000000003 | 1 | 1 | 0 |
| 1.064000000000003 | 1 | 1 | 0 |
| 1.068000000000003 | 1 | 1 | 0 |
| 1.072000000000003 | 1 | 1 | 0 |
| 1.076000000000003 | 1 | 1 | 0 |
| 1.080000000000003 | 1 | 1 | 0 |
| 1.084000000000003 | 1 | 1 | 0 |
| 1.088000000000003 | 1 | 1 | 0 |
| 1.092000000000003 | 1 | 1 | 0 |
| 1.096000000000003 | 1 | 1 | 0 |
| 1.100000000000003 | 1 | 1 | 0 |
| 1.104000000000003 | 1 | 1 | 0 |
| 1.108000000000003 | 1 | 1 | 0 |
| 1.112000000000003 | 1 | 1 | 0 |
| 1.116000000000003 | 1 | 1 | 0 |
| 1.120000000000003 | 1 | 1 | 0 |
| 1.124000000000003 | 1 | 1 | 0 |
| 1.128000000000003 | 1 | 1 | 0 |
| 1.132000000000003 | 1 | 1 | 0 |
| 1.136000000000003 | 1 | 1 | 0 |
| 1.140000000000003 | 1 | 1 | 0 |
| 1.144000000000003 | 1 | 1 | 0 |
| 1.148000000000003 | 1 | 1 | 0 |
| 1.152000000000003 | 1 | 1 | 0 |
| 1.156000000000003 | 1 | 1 | 0 |
| 1.160000000000003 | 1 | 1 | 0 |
| 1.164000000000003 | 1 | 1 | 0 |
| 1.168000000000003 | 1 | 1 | 0 |
| 1.172000000000003 | 1 | 1 | 0 |
| 1.176000000000003 | 1 | 1 | 0 |
| 1.180000000000003 | 1 | 1 | 0 |
| 1.184000000000003 | 1 | 1 | 0 |
| 1.188000000000003 | 1 | 1 | 0 |
| 1.192000000000003 | 1 | 1 | 0 |
| 1.196000000000003 | 1 | 1 | 0 |
| 1.200000000000003 | 1 | 1 | 0 |
| 1.204000000000003 | 1 | 1 | 0 |
| 1.208000000000004 | 1 | 1 | 0 |
| 1.212000000000004 | 1 | 1 | 0 |
| 1.216000000000004 | 1 | 1 | 0 |
| 1.220000000000004 | 1 | 1 | 0 |
| 1.224000000000004 | 1 | 1 | 0 |
| 1.228000000000004 | 1 | 1 | 0 |
| 1.232000000000004 | 1 | 1 | 0 |
| 1.236000000000004 | 1 | 1 | 0 |
| 1.240000000000004 | 1 | 1 | 0 |
| 1.244000000000004 | 1 | 1 | 0 |
| 1.248000000000004 | 1 | 1 | 0 |
| 1.252000000000004 | 1 | 1 | 0 |
| 1.256000000000004 | 1 | 1 | 0 |
| 1.260000000000004 | 1 | 1 | 0 |
| 1.264000000000004 | 1 | 1 | 0 |
| 1.268000000000004 | 1 | 1 | 0 |
| 1.272000000000004 | 1 | 1 | 0 |
| 1.276000000000004 | 1 | 1 | 0 |
| 1.280000000000004 | 1 | 1 | 0 |
| 1.284000000000004 | 1 | 1 | 0 |
| 1.288000000000004 | 1 | 1 | 0 |
| 1.292000000000004 | 1 | 1 | 0 |
| 1.296000000000004 | 1 | 1 | 0 |
| 1.300000000000004 | 1 | 1 | 0 |
| 1.304000000000004 | 1 | 1 | 0 |
| 1.308000000000004 | 1 | 1 | 0 |
| 1.312000000000004 | 1 | 1 | 0 |
| 1.316000000000004 | 1 | 1 | 0 |
| 1.320000000000004 | 1 | 1 | 0 |
| 1.324000000000004 | 1 | 1 | 0 |
| 1.328000000000004 | 1 | 1 | 0 |
| 1.332000000000004 | 1 | 1 | 0 |
| 1.336000000000004 | 1 | 1 | 0 |
| 1.340000000000004 | 1 | 1 | 0 |
| 1.344000000000004 | 1 | 1 | 0 |
| 1.348000000000004 | 1 | 1 | 0 |
| 1.352000000000004 | 1 | 1 | 0 |
| 1.356000000000004 | 1 | 1 | 0 |
| 1.360000000000004 | 1 | 1 | 0 |
| 1.364000000000004 | 1 | 1 | 0 |
| 1.368000000000004 | 1 | 1 | 0 |
| 1.372000000000004 | 1 | 1 | 0 |
| 1.376000000000004 | 1 | 1 | 0 |
| 1.380000000000004 | 1 | 1 | 0 |
| 1.384000000000004 | 1 | 1 | 0 |
| 1.388000000000004 | 1 | 1 | 0 |
| 1.392000000000004 | 1 | 1 | 0 |
| 1.396000000000004 | 1 | 1 | 0 |
| 1.400000000000004 | 1 | 1 | 0 |
| 1.404000000000004 | 1 | 1 | 0 |
| 1.408000000000004 | 1 | 1 | 0 |
| 1.412000000000004 | 1 | 1 | 0 |
| 1.416000000000004 | 1 | 1 | 0 |
| 1.420000000000004 | 1 | 1 | 0 |
| 1.424000000000004 | 1 | 1 | 0 |
| 1.428000000000004 | 1 | 1 | 0 |
| 1.432000000000004 | 1 | 1 | 0 |
| 1.436000000000004 | 1 | 1 | 0 |
| 1.440000000000004 | 1 | 1 | 0 |
| 1.444000000000004 | 1 | 1 | 0 |
| 1.448000000000004 | 1 | 1 | 0 |
| 1.452000000000004 | 1 | 1 | 0 |
| 1.456000000000004 | 1 | 1 | 0 |
| 1.460000000000004 | 1 | 1 | 0 |
| 1.464000000000004 | 1 | 1 | 0 |
| 1.468000000000004 | 1 | 1 | 0 |
| 1.472000000000004 | 1 | 1 | 0 |
| 1.476000000000004 | 1 | 1 | 0 |
| 1.480000000000004 | 1 | 1 | 0 |
| 1.484000000000004 | 1 | 1 | 0 |
| 1.488000000000004 | 1 | 1 | 0 |
| 1.492000000000004 | 1 | 1 | 0 |
| 1.496000000000004 | 1 | 1 | 0 |
| 1.500000000000004 | 1 | 1 | 0 |
| 1.504000000000004 | 1 | 1 | 0 |
| 1.508000000000004 | 1 | 1 | 0 |
| 1.512000000000004 | 1 | 1 | 0 |
| 1.516000000000004 | 1 | 1 | 0 |
| 1.520000000000004 | 1 | 1 | 0 |
| 1.524000000000004 | 1 | 1 | 0 |
| 1.528000000000004 | 1 | 1 | 0 |
| 1.532000000000004 | 1 | 1 | 0 |
| 1.536000000000004 | 1 | 1 | 0 |
| 1.540000000000004 | 1 | 1 | 0 |
| 1.544000000000004 | 1 | 1 | 0 |
| 1.548000000000004 | 1 | 1 | 0 |
| 1.552000000000004 | 1 | 1 | 0 |
| 1.556000000000004 | 1 | 1 | 0 |
| 1.560000000000004 | 1 | 1 | 0 |
| 1.564000000000004 | 1 | 1 | 0 |
| 1.568000000000004 | 1 | 1 | 0 |
| 1.572000000000004 | 1 | 1 | 0 |
| 1.576000000000004 | 1 | 1 | 0 |
| 1.580000000000004 | 1 | 1 | 0 |
| 1.584000000000004 | 1 | 1 | 0 |
| 1.588000000000004 | 1 | 1 | 0 |
| 1.592000000000004 | 1 | 1 | 0 |
| 1.596000000000004 | 1 | 1 | 0 |
| 1.600000000000004 | 1 | 1 | 0 |
| 1.604000000000004 | 1 | 1 | 0 |
| 1.608000000000004 | 1 | 1 | 0 |
| 1.612000000000004 | 1 | 1 | 0 |
| 1.616000000000004 | 1 | 1 | 0 |
| 1.620000000000004 | 1 | 1 | 0 |
| 1.624000000000004 | 1 | 1 | 0 |
| 1.628000000000004 | 1 | 1 | 0 |
| 1.632000000000004 | 1 | 1 | 0 |
| 1.636000000000004 | 1 | 1 | 0 |
| 1.640000000000004 | 1 | 1 | 0 |
| 1.644000000000004 | 1 | 1 | 0 |
| 1.648000000000004 | 1 | 1 | 0 |
| 1.652000000000004 | 1 | 1 | 0 |
| 1.656000000000004 | 1 | 1 | 0 |
| 1.660000000000004 | 1 | 1 | 0 |
| 1.664000000000004 | 1 | 1 | 0 |
| 1.668000000000004 | 1 | 1 | 0 |
| 1.672000000000004 | 1 | 1 | 0 |
| 1.676000000000004 | 1 | 1 | 0 |
| 1.680000000000004 | 1 | 1 | 0 |
| 1.684000000000004 | 1 | 1 | 0 |
| 1.688000000000004 | 1 | 1 | 0 |
| 1.692000000000004 | 1 | 1 | 0 |
| 1.696000000000004 | 1 | 1 | 0 |
| 1.700000000000004 | 1 | 1 | 0 |
| 1.704000000000004 | 1 | 1 | 0 |
| 1.708000000000004 | 1 | 1 | 0 |
| 1.712000000000004 | 1 | 1 | 0 |
| 1.716000000000004 | 1 | 1 | 0 |
| 1.720000000000004 | 1 | 1 | 0 |
| 1.724000000000004 | 1 | 1 | 0 |
| 1.728000000000004 | 1 | 1 | 0 |
| 1.732000000000004 | 1 | 1 | 0 |
| 1.736000000000004 | 1 | 1 | 0 |
| 1.740000000000004 | 1 | 1 | 0 |
| 1.744000000000004 | 1 | 1 | 0 |
| 1.748000000000004 | 1 | 1 | 0 |
| 1.752000000000004 | 1 | 1 | 0 |
| 1.756000000000004 | 1 | 1 | 0 |
| 1.760000000000004 | 1 | 1 | 0 |
| 1.764000000000004 | 1 | 1 | 0 |
| 1.768000000000004 | 1 | 1 | 0 |
| 1.772000000000004 | 1 | 1 | 0 |
| 1.776000000000004 | 1 | 1 | 0 |
| 1.780000000000004 | 1 | 1 | 0 |
| 1.784000000000004 | 1 | 1 | 0 |
| 1.788000000000004 | 1 | 1 | 0 |
| 1.792000000000004 | 1 | 1 | 0 |
| 1.796000000000004 | 1 | 1 | 0 |
| 1.800000000000004 | 1 | 1 | 0 |
| 1.804000000000004 | 1 | 1 | 0 |
| 1.808000000000004 | 1 | 1 | 0 |
| 1.812000000000004 | 1 | 1 | 0 |
| 1.816000000000004 | 1 | 1 | 0 |
| 1.820000000000004 | 1 | 1 | 0 |
| 1.824000000000004 | 1 | 1 | 0 |
| 1.828000000000004 | 1 | 1 | 0 |
| 1.832000000000004 | 1 | 1 | 0 |
| 1.836000000000004 | 1 | 1 | 0 |
| 1.840000000000004 | 1 | 1 | 0 |
| 1.844000000000004 | 1 | 1 | 0 |
| 1.848000000000004 | 1 | 1 | 0 |
| 1.852000000000004 | 1 | 1 | 0 |
| 1.856000000000004 | 1 | 1 | 0 |
| 1.860000000000004 | 1 | 1 | 0 |
| 1.864000000000004 | 1 | 1 | 0 |
| 1.868000000000004 | 1 | 1 | 0 |
| 1.872000000000004 | 1 | 1 | 0 |
| 1.876000000000004 | 1 | 1 | 0 |
| 1.880000000000004 | 1 | 1 | 0 |
| 1.884000000000004 | 1 | 1 | 0 |
| 1.888000000000004 | 1 | 1 | 0 |
| 1.892000000000004 | 1 | 1 | 0 |
| 1.896000000000004 | 1 | 1 | 0 |
| 1.900000000000004 | 1 | 1 | 0 |
| 1.904000000000004 | 1 | 1 | 0 |
| 1.908000000000004 | 1 | 1 | 0 |
| 1.912000000000004 | 1 | 1 | 0 |
| 1.916000000000004 | 1 | 1 | 0 |
| 1.920000000000004 | 1 | 1 | 0 |
| 1.924000000000004 | 1 | 1 | 0 |
| 1.928000000000004 | 1 | 1 | 0 |
| 1.932000000000004 | 1 | 1 | 0 |
| 1.936000000000004 | 1 | 1 | 0 |
| 1.940000000000004 | 1 | 1 | 0 |
| 1.944000000000004 | 1 | 1 | 0 |
| 1.948000000000004 | 1 | 1 | 0 |
| 1.952000000000004 | 1 | 1 | 0 |
| 1.956000000000004 | 1 | 1 | 0 |
| 1.960000000000004 | 1 | 1 | 0 |
| 1.964000000000004 | 1 | 1 | 0 |
| 1.968000000000004 | 1 | 1 | 0 |
| 1.972000000000004 | 1 | 1 | 0 |
| 1.976000000000004 | 1 | 1 | 0 |
| 1.980000000000004 | 1 | 1 | 0 |
| 1.984000000000004 | 1 | 1 | 0 |
| 1.988000000000004 | 1 | 1 | 0 |
| 1.992000000000004 | 1 | 1 | 0 |
| 1.996000000000004 | 1 | 1 | 0 |
| 2.000000000000004 | 1 | 1 | 0 |
| 2.004000000000004 | 1 | 1 | 0 |
| 2.008000000000004 | 1 | 1 | 0 |
| 2.012000000000004 | 1 | 1 | 0 |
| 2.016000000000004 | 1 | 1 | 0 |
| 2.020000000000004 | 1 | 1 | 0 |
| 2.024000000000004 | 1 | 1 | 0 |
| 2.028000000000004 | 1 | 1 | 0 |
| 2.032000000000004 | 1 | 1 | 0 |
| 2.036000000000004 | 1 | 1 | 0 |
| 2.040000000000004 | 1 | 1 | 0 |
| 2.044000000000004 | 1 | 1 | 0 |
| 2.048000000000004 | 1 | 1 | 0 |
| 2.052000000000004 | 1 | 1 | 0 |
| 2.056000000000004 | 1 | 1 | 0 |
| 2.060000000000004 | 1 | 1 | 0 |
| 2.064000000000004 | 1 | 1 | 0 |
| 2.068000000000004 | 1 | 1 | 0 |
| 2.072000000000004 | 1 | 1 | 0 |
| 2.076000000000004 | 1 | 1 | 0 |
| 2.080000000000004 | 1 | 1 | 0 |
| 2.084000000000004 | 1 | 1 | 0 |
| 2.088000000000004 | 1 | 1 | 0 |
| 2.092000000000004 | 1 | 1 | 0 |
| 2.096000000000004 | 1 | 1 | 0 |
| 2.100000000000004 | 1 | 1 | 0 |
| 2.104000000000004 | 1 | 1 | 0 |
| 2.108000000000004 | 1 | 1 | 0 |
| 2.112000000000004 | 1 | 1 | 0 |
| 2.116000000000004 | 1 | 1 | 0 |
| 2.120000000000004 | 1 | 1 | 0 |
| 2.124000000000004 | 1 | 1 | 0 |
| 2.128000000000004 | 1 | 1 | 0 |
| 2.132000000000004 | 1 | 1 | 0 |
| 2.136000000000004 | 1 | 1 | 0 |
| 2.140000000000004 | 1 | 1 | 0 |
| 2.144000000000004 | 1 | 1 | 0 |
| 2.148000000000004 | 1 | 1 | 0 |
| 2.152000000000004 | 1 | 1 | 0 |
| 2.156000000000004 | 1 | 1 | 0 |
| 2.160000000000004 | 1 | 1 | 0 |
| 2.164000000000004 | 1 | 1 | 0 |
| 2.168000000000004 | 1 | 1 | 0 |
| 2.172000000000004 | 1 | 1 | 0 |
| 2.176000000000004 | 1 | 1 | 0 |
| 2.180000000000004 | 1 | 1 | 0 |
| 2.184000000000004 | 1 | 1 | 0 |
| 2.188000000000004 | 1 | 1 | 0 |
| 2.192000000000004 | 1 | 1 | 0 |
| 2.196000000000004 | 1 | 1 | 0 |
| 2.200000000000004 | 1 | 1 | 0 |
| 2.204000000000004 | 1 | 1 | 0 |
| 2.208000000000004 | 1 | 1 | 0 |
| 2.212000000000004 | 1 | 1 | 0 |
| 2.216000000000004 | 1 | 1 | 0 |
| 2.220000000000004 | 1 | 1 | 0 |
| 2.224000000000004 | 1 | 1 | 0 |
| 2.228000000000004 | 1 | 1 | 0 |
| 2.232000000000004 | 1 | 1 | 0 |
| 2.236000000000004 | 1 | 1 | 0 |
| 2.240000000000004 | 1 | 1 | 0 |
| 2.244000000000004 | 1 | 1 | 0 |
| 2.248000000000004 | 1 | 1 | 0 |
| 2.252000000000004 | 1 | 1 | 0 |
| 2.256000000000004 | 1 | 1 | 0 |
| 2.260000000000004 | 1 | 1 | 0 |
| 2.264000000000004 | 1 | 1 | 0 |
| 2.268000000000004 | 1 | 1 | 0 |
| 2.272000000000004 | 1 | 1 | 0 |
| 2.276000000000004 | 1 | 1 | 0 |
| 2.280000000000004 | 1 | 1 | 0 |
| 2.284000000000004 | 1 | 1 | 0 |
| 2.288000000000004 | 1 | 1 | 0 |
| 2.292000000000004 | 1 | 1 | 0 |
| 2.296000000000004 | 1 | 1 | 0 |
| 2.300000000000004 | 1 | 1 | 0 |
| 2.304000000000004 | 1 | 1 | 0 |
| 2.308000000000004 | 1 | 1 | 0 |
| 2.312000000000004 | 1 | 1 | 0 |
| 2.316000000000004 | 1 | 1 | 0 |
| 2.320000000000004 | 1 | 1 | 0 |
| 2.324000000000004 | 1 | 1 | 0 |
| 2.328000000000004 | 1 | 1 | 0 |
| 2.332000000000004 | 1 | 1 | 0 |
| 2.336000000000004 | 1 | 1 | 0 |
| 2.340000000000004 | 1 | 1 | 0 |
| 2.344000000000004 | 1 | 1 | 0 |
| 2.348000000000004 | 1 | 1 | 0 |
| 2.352000000000004 | 1 | 1 | 0 |
| 2.356000000000004 | 1 | 1 | 0 |
| 2.360000000000004 | 1 | 1 | 0 |
| 2.364000000000004 | 1 | 1 | 0 |
| 2.368000000000004 | 1 | 1 | 0 |
| 2.372000000000004 | 1 | 1 | 0 |
| 2.376000000000004 | 1 | 1 | 0 |
| 2.380000000000004 | 1 | 1 | 0 |
| 2.384000000000004 | 1 | 1 | 0 |
| 2.388000000000004 | 1 | 1 | 0 |
| 2.392000000000004 | 1 | 1 | 0 |
| 2.396000000000004 | 1 | 1 | 0 |
| 2.400000000000004 | 1 | 1 | 0 |
| 2.404000000000004 | 1 | 1 | 0 |
| 2.408000000000004 | 1 | 1 | 0 |
| 2.412000000000004 | 1 | 1 | 0 |
| 2.416000000000004 | 1 | 1 | 0 |
| 2.420000000000004 | 1 | 1 | 0 |
| 2.424000000000004 | 1 | 1 | 0 |
| 2.428000000000004 | 1 | 1 | 0 |
| 2.432000000000004 | 1 | 1 | 0 |
| 2.436000000000004 | 1 | 1 | 0 |
| 2.440000000000004 | 1 | 1 | 0 |
| 2.444000000000004 | 1 | 1 | 0 |
| 2.448000000000004 | 1 | 1 | 0 |
| 2.452000000000004 | 1 | 1 | 0 |
| 2.456000000000004 | 1 | 1 | 0 |
| 2.460000000000004 | 1 | 1 | 0 |
| 2.464000000000004 | 1 | 1 | 0 |
| 2.468000000000004 | 1 | 1 | 0 |
| 2.472000000000004 | 1 | 1 | 0 |
| 2.476000000000004 | 1 | 1 | 0 |
| 2.480000000000004 | 1 | 1 | 0 |
| 2.484000000000004 | 1 | 1 | 0 |
| 2.488000000000004 | 1 | 1 | 0 |
| 2.492000000000004 | 1 | 1 | 0 |
| 2.496000000000004 | 1 | 1 | 0 |
| 2.500000000000004 | 1 | 1 | 0 |
| 2.504000000000004 | 1 | 1 | 0 |
| 2.508000000000004 | 1 | 1 | 0 |
| 2.512000000000004 | 1 | 1 | 0 |
| 2.516000000000004 | 1 | 1 | 0 |
| 2.520000000000004 | 1 | 1 | 0 |
| 2.524000000000004 | 1 | 1 | 0 |
| 2.528000000000004 | 1 | 1 | 0 |
| 2.532000000000004 | 1 | 1 | 0 |
| 2.536000000000004 | 1 | 1 | 0 |
| 2.540000000000004 | 1 | 1 | 0 |
| 2.544000000000004 | 1 | 1 | 0 |
| 2.548000000000004 | 1 | 1 | 0 |
| 2.552000000000004 | 1 | 1 | 0 |
| 2.556000000000004 | 1 | 1 | 0 |
| 2.560000000000004 | 1 | 1 | 0 |
| 2.564000000000004 | 1 | 1 | 0 |
| 2.568000000000004 | 1 | 1 | 0 |
| 2.572000000000004 | 1 | 1 | 0 |
| 2.576000000000004 | 1 | 1 | 0 |
| 2.580000000000004 | 1 | 1 | 0 |
| 2.584000000000004 | 1 | 1 | 0 |
| 2.588000000000005 | 1 | 1 | 0 |
| 2.592000000000004 | 1 | 1 | 0 |
| 2.596000000000004 | 1 | 1 | 0 |
| 2.600000000000004 | 1 | 1 | 0 |
| 2.604000000000004 | 1 | 1 | 0 |
| 2.608000000000004 | 1 | 1 | 0 |
| 2.612000000000004 | 1 | 1 | 0 |
| 2.616000000000004 | 1 | 1 | 0 |
| 2.620000000000004 | 1 | 1 | 0 |
| 2.624000000000004 | 1 | 1 | 0 |
| 2.628000000000004 | 1 | 1 | 0 |
| 2.632000000000004 | 1 | 1 | 0 |
| 2.636000000000004 | 1 | 1 | 0 |
| 2.640000000000004 | 1 | 1 | 0 |
| 2.644000000000004 | 1 | 1 | 0 |
| 2.648000000000004 | 1 | 1 | 0 |
| 2.652000000000004 | 1 | 1 | 0 |
| 2.656000000000004 | 1 | 1 | 0 |
| 2.660000000000004 | 1 | 1 | 0 |
| 2.664000000000004 | 1 | 1 | 0 |
| 2.668000000000004 | 1 | 1 | 0 |
| 2.672000000000004 | 1 | 1 | 0 |
| 2.676000000000004 | 1 | 1 | 0 |
| 2.680000000000004 | 1 | 1 | 0 |
| 2.684000000000004 | 1 | 1 | 0 |
| 2.688000000000005 | 1 | 1 | 0 |
| 2.692000000000004 | 1 | 1 | 0 |
| 2.696000000000004 | 1 | 1 | 0 |
| 2.700000000000005 | 1 | 1 | 0 |
| 2.704000000000005 | 1 | 1 | 0 |
| 2.708000000000005 | 1 | 1 | 0 |
| 2.712000000000005 | 1 | 1 | 0 |
| 2.716000000000005 | 1 | 1 | 0 |
| 2.720000000000005 | 1 | 1 | 0 |
| 2.724000000000005 | 1 | 1 | 0 |
| 2.728000000000005 | 1 | 1 | 0 |
| 2.732000000000005 | 1 | 1 | 0 |
| 2.736000000000005 | 1 | 1 | 0 |
| 2.740000000000005 | 1 | 1 | 0 |
| 2.744000000000005 | 1 | 1 | 0 |
| 2.748000000000005 | 1 | 1 | 0 |
| 2.752000000000005 | 1 | 1 | 0 |
| 2.756000000000005 | 1 | 1 | 0 |
| 2.760000000000005 | 1 | 1 | 0 |
| 2.764000000000005 | 1 | 1 | 0 |
| 2.768000000000005 | 1 | 1 | 0 |
| 2.772000000000005 | 1 | 1 | 0 |
| 2.776000000000005 | 1 | 1 | 0 |
| 2.780000000000005 | 1 | 1 | 0 |
| 2.784000000000005 | 1 | 1 | 0 |
| 2.788000000000005 | 1 | 1 | 0 |
| 2.792000000000005 | 1 | 1 | 0 |
| 2.796000000000005 | 1 | 1 | 0 |
| 2.800000000000005 | 1 | 1 | 0 |
| 2.804000000000005 | 1 | 1 | 0 |
| 2.808000000000005 | 1 | 1 | 0 |
| 2.812000000000005 | 1 | 1 | 0 |
| 2.816000000000005 | 1 | 1 | 0 |
| 2.820000000000005 | 1 | 1 | 0 |
| 2.824000000000005 | 1 | 1 | 0 |
| 2.828000000000005 | 1 | 1 | 0 |
| 2.832000000000005 | 1 | 1 | 0 |
| 2.836000000000005 | 1 | 1 | 0 |
| 2.840000000000005 | 1 | 1 | 0 |
| 2.844000000000005 | 1 | 1 | 0 |
| 2.848000000000005 | 1 | 1 | 0 |
| 2.852000000000005 | 1 | 1 | 0 |
| 2.856000000000005 | 1 | 1 | 0 |
| 2.860000000000005 | 1 | 1 | 0 |
| 2.864000000000005 | 1 | 1 | 0 |
| 2.868000000000005 | 1 | 1 | 0 |
| 2.872000000000005 | 1 | 1 | 0 |
| 2.876000000000005 | 1 | 1 | 0 |
| 2.880000000000005 | 1 | 1 | 0 |
| 2.884000000000005 | 1 | 1 | 0 |
| 2.888000000000005 | 1 | 1 | 0 |
| 2.892000000000005 | 1 | 1 | 0 |
| 2.896000000000005 | 1 | 1 | 0 |
| 2.900000000000005 | 1 | 1 | 0 |
| 2.904000000000005 | 1 | 1 | 0 |
| 2.908000000000005 | 1 | 1 | 0 |
| 2.912000000000005 | 1 | 1 | 0 |
| 2.916000000000005 | 1 | 1 | 0 |
| 2.920000000000005 | 1 | 1 | 0 |
| 2.924000000000005 | 1 | 1 | 0 |
| 2.928000000000005 | 1 | 1 | 0 |
| 2.932000000000005 | 1 | 1 | 0 |
| 2.936000000000005 | 1 | 1 | 0 |
| 2.940000000000005 | 1 | 1 | 0 |
| 2.944000000000005 | 1 | 1 | 0 |
| 2.948000000000005 | 1 | 1 | 0 |
| 2.952000000000005 | 1 | 1 | 0 |
| 2.956000000000005 | 1 | 1 | 0 |
| 2.960000000000005 | 1 | 1 | 0 |
| 2.964000000000005 | 1 | 1 | 0 |
| 2.968000000000005 | 1 | 1 | 0 |
| 2.972000000000005 | 1 | 1 | 0 |
| 2.976000000000005 | 1 | 1 | 0 |
| 2.980000000000005 | 1 | 1 | 0 |
| 2.984000000000005 | 1 | 1 | 0 |
| 2.988000000000005 | 1 | 1 | 0 |
| 2.992000000000005 | 1 | 1 | 0 |
| 2.996000000000005 | 1 | 1 | 0 |
| 3.000000000000005 | 1 | 1 | 1 |
| 3.004000000000005 | 1 | 1 | 1 |
| 3.008000000000005 | 1 | 1 | 1 |
| 3.012000000000005 | 1 | 1 | 1 |
| 3.016000000000005 | 1 | 1 | 1 |
| 3.020000000000005 | 1 | 1 | 1 |
| 3.024000000000005 | 1 | 1 | 1 |
| 3.028000000000005 | 1 | 1 | 1 |
| 3.032000000000005 | 1 | 1 | 1 |
| 3.036000000000005 | 1 | 1 | 1 |
| 3.040000000000005 | 1 | 1 | 1 |
| 3.044000000000005 | 1 | 1 | 1 |
| 3.048000000000005 | 1 | 1 | 1 |
| 3.052000000000005 | 1 | 1 | 1 |
| 3.056000000000005 | 1 | 1 | 1 |
| 3.060000000000005 | 1 | 1 | 1 |
| 3.064000000000005 | 1 | 1 | 1 |
| 3.068000000000005 | 1 | 1 | 1 |
| 3.072000000000005 | 1 | 1 | 1 |
| 3.076000000000005 | 1 | 1 | 1 |
| 3.080000000000005 | 1 | 1 | 1 |
| 3.084000000000005 | 1 | 1 | 1 |
| 3.088000000000005 | 1 | 1 | 1 |
| 3.092000000000005 | 1 | 1 | 1 |
| 3.096000000000005 | 1 | 1 | 1 |
| 3.100000000000005 | 1 | 1 | 1 |
| 3.104000000000005 | 1 | 1 | 1 |
| 3.108000000000005 | 1 | 1 | 1 |
| 3.112000000000005 | 1 | 1 | 1 |
| 3.116000000000005 | 1 | 1 | 1 |
| 3.120000000000005 | 1 | 1 | 1 |
| 3.124000000000005 | 1 | 1 | 1 |
| 3.128000000000005 | 1 | 1 | 1 |
| 3.132000000000005 | 1 | 1 | 1 |
| 3.136000000000005 | 1 | 1 | 1 |
| 3.140000000000005 | 1 | 1 | 1 |
| 3.144000000000005 | 1 | 1 | 1 |
| 3.148000000000005 | 1 | 1 | 1 |
| 3.152000000000005 | 1 | 1 | 1 |
| 3.156000000000005 | 1 | 1 | 1 |
| 3.160000000000005 | 1 | 1 | 1 |
| 3.164000000000005 | 1 | 1 | 1 |
| 3.168000000000005 | 1 | 1 | 1 |
| 3.172000000000005 | 1 | 1 | 1 |
| 3.176000000000005 | 1 | 1 | 1 |
| 3.180000000000005 | 1 | 1 | 1 |
| 3.184000000000005 | 1 | 1 | 1 |
| 3.188000000000005 | 1 | 1 | 1 |
| 3.192000000000005 | 1 | 1 | 1 |
| 3.196000000000005 | 1 | 1 | 1 |
| 3.200000000000005 | 1 | 1 | 1 |
| 3.204000000000005 | 1 | 1 | 1 |
| 3.208000000000005 | 1 | 1 | 1 |
| 3.212000000000005 | 1 | 1 | 1 |
| 3.216000000000005 | 1 | 1 | 1 |
| 3.220000000000005 | 1 | 1 | 1 |
| 3.224000000000005 | 1 | 1 | 1 |
| 3.228000000000005 | 1 | 1 | 1 |
| 3.232000000000005 | 1 | 1 | 1 |
| 3.236000000000005 | 1 | 1 | 1 |
| 3.240000000000005 | 1 | 1 | 1 |
| 3.244000000000005 | 1 | 1 | 1 |
| 3.248000000000005 | 1 | 1 | 1 |
| 3.252000000000005 | 1 | 1 | 1 |
| 3.256000000000005 | 1 | 1 | 1 |
| 3.260000000000005 | 1 | 1 | 1 |
| 3.264000000000005 | 1 | 1 | 1 |
| 3.268000000000005 | 1 | 1 | 1 |
| 3.272000000000005 | 1 | 1 | 1 |
| 3.276000000000005 | 1 | 1 | 1 |
| 3.280000000000005 | 1 | 1 | 1 |
| 3.284000000000005 | 1 | 1 | 1 |
| 3.288000000000005 | 1 | 1 | 1 |
| 3.292000000000005 | 1 | 1 | 1 |
| 3.296000000000005 | 1 | 1 | 1 |
| 3.300000000000005 | 1 | 1 | 1 |
| 3.304000000000005 | 1 | 1 | 1 |
| 3.308000000000005 | 1 | 1 | 1 |
| 3.312000000000005 | 1 | 1 | 1 |
| 3.316000000000005 | 1 | 1 | 1 |
| 3.320000000000005 | 1 | 1 | 1 |
| 3.324000000000005 | 1 | 1 | 1 |
| 3.328000000000005 | 1 | 1 | 1 |
| 3.332000000000005 | 1 | 1 | 1 |
| 3.336000000000005 | 1 | 1 | 1 |
| 3.340000000000005 | 1 | 1 | 1 |
| 3.344000000000005 | 1 | 1 | 1 |
| 3.348000000000005 | 1 | 1 | 1 |
| 3.352000000000005 | 1 | 1 | 1 |
| 3.356000000000005 | 1 | 1 | 1 |
| 3.360000000000005 | 1 | 1 | 1 |
| 3.364000000000005 | 1 | 1 | 1 |
| 3.368000000000005 | 1 | 1 | 1 |
| 3.372000000000005 | 1 | 1 | 1 |
| 3.376000000000005 | 1 | 1 | 1 |
| 3.380000000000005 | 1 | 1 | 1 |
| 3.384000000000005 | 1 | 1 | 1 |
| 3.388000000000005 | 1 | 1 | 1 |
| 3.392000000000005 | 1 | 1 | 1 |
| 3.396000000000005 | 1 | 1 | 1 |
| 3.400000000000005 | 1 | 1 | 1 |
| 3.404000000000005 | 1 | 1 | 1 |
| 3.408000000000005 | 1 | 1 | 1 |
| 3.412000000000005 | 1 | 1 | 1 |
| 3.416000000000005 | 1 | 1 | 1 |
| 3.420000000000005 | 1 | 1 | 1 |
| 3.424000000000005 | 1 | 1 | 1 |
| 3.428000000000005 | 1 | 1 | 1 |
| 3.432000000000005 | 1 | 1 | 1 |
| 3.436000000000005 | 1 | 1 | 1 |
| 3.440000000000005 | 1 | 1 | 1 |
| 3.444000000000005 | 1 | 1 | 1 |
| 3.448000000000005 | 1 | 1 | 1 |
| 3.452000000000005 | 1 | 1 | 1 |
| 3.456000000000005 | 1 | 1 | 1 |
| 3.460000000000005 | 1 | 1 | 1 |
| 3.464000000000005 | 1 | 1 | 1 |
| 3.468000000000005 | 1 | 1 | 1 |
| 3.472000000000005 | 1 | 1 | 1 |
| 3.476000000000005 | 1 | 1 | 1 |
| 3.480000000000005 | 1 | 1 | 1 |
| 3.484000000000005 | 1 | 1 | 1 |
| 3.488000000000005 | 1 | 1 | 1 |
| 3.492000000000005 | 1 | 1 | 1 |
| 3.496000000000005 | 1 | 1 | 1 |
| 3.500000000000005 | 1 | 1 | 1 |
| 3.504000000000005 | 1 | 1 | 1 |
| 3.508000000000005 | 1 | 1 | 1 |
| 3.512000000000005 | 1 | 1 | 1 |
| 3.516000000000005 | 1 | 1 | 1 |
| 3.520000000000005 | 1 | 1 | 1 |
| 3.524000000000005 | 1 | 1 | 1 |
| 3.528000000000005 | 1 | 1 | 1 |
| 3.532000000000005 | 1 | 1 | 1 |
| 3.536000000000005 | 1 | 1 | 1 |
| 3.540000000000005 | 1 | 1 | 1 |
| 3.544000000000005 | 1 | 1 | 1 |
| 3.548000000000005 | 1 | 1 | 1 |
| 3.552000000000005 | 1 | 1 | 1 |
| 3.556000000000005 | 1 | 1 | 1 |
| 3.560000000000005 | 1 | 1 | 1 |
| 3.564000000000005 | 1 | 1 | 1 |
| 3.568000000000005 | 1 | 1 | 1 |
| 3.572000000000005 | 1 | 1 | 1 |
| 3.576000000000005 | 1 | 1 | 1 |
| 3.580000000000005 | 1 | 1 | 1 |
| 3.584000000000005 | 1 | 1 | 1 |
| 3.588000000000005 | 1 | 1 | 1 |
| 3.592000000000005 | 1 | 1 | 1 |
| 3.596000000000005 | 1 | 1 | 1 |
| 3.600000000000005 | 1 | 1 | 1 |
| 3.604000000000005 | 1 | 1 | 1 |
| 3.608000000000005 | 1 | 1 | 1 |
| 3.612000000000005 | 1 | 1 | 1 |
| 3.616000000000005 | 1 | 1 | 1 |
| 3.620000000000005 | 1 | 1 | 1 |
| 3.624000000000005 | 1 | 1 | 1 |
| 3.628000000000005 | 1 | 1 | 1 |
| 3.632000000000005 | 1 | 1 | 1 |
| 3.636000000000005 | 1 | 1 | 1 |
| 3.640000000000005 | 1 | 1 | 1 |
| 3.644000000000005 | 1 | 1 | 1 |
| 3.648000000000005 | 1 | 1 | 1 |
| 3.652000000000005 | 1 | 1 | 1 |
| 3.656000000000005 | 1 | 1 | 1 |
| 3.660000000000005 | 1 | 1 | 1 |
| 3.664000000000005 | 1 | 1 | 1 |
| 3.668000000000005 | 1 | 1 | 1 |
| 3.672000000000005 | 1 | 1 | 1 |
| 3.676000000000005 | 1 | 1 | 1 |
| 3.680000000000005 | 1 | 1 | 1 |
| 3.684000000000005 | 1 | 1 | 1 |
| 3.688000000000005 | 1 | 1 | 1 |
| 3.692000000000005 | 1 | 1 | 1 |
| 3.696000000000005 | 1 | 1 | 1 |
| 3.700000000000005 | 1 | 1 | 1 |
| 3.704000000000005 | 1 | 1 | 1 |
| 3.708000000000005 | 1 | 1 | 1 |
| 3.712000000000005 | 1 | 1 | 1 |
| 3.716000000000005 | 1 | 1 | 1 |
| 3.720000000000005 | 1 | 1 | 1 |
| 3.724000000000005 | 1 | 1 | 1 |
| 3.728000000000005 | 1 | 1 | 1 |
| 3.732000000000005 | 1 | 1 | 1 |
| 3.736000000000005 | 1 | 1 | 1 |
| 3.740000000000005 | 1 | 1 | 1 |
| 3.744000000000005 | 1 | 1 | 1 |
| 3.748000000000005 | 1 | 1 | 1 |
| 3.752000000000005 | 1 | 1 | 1 |
| 3.756000000000005 | 1 | 1 | 1 |
| 3.760000000000005 | 1 | 1 | 1 |
| 3.764000000000005 | 1 | 1 | 1 |
| 3.768000000000005 | 1 | 1 | 1 |
| 3.772000000000005 | 1 | 1 | 1 |
| 3.776000000000005 | 1 | 1 | 1 |
| 3.780000000000005 | 1 | 1 | 1 |
| 3.784000000000005 | 1 | 1 | 1 |
| 3.788000000000006 | 1 | 1 | 1 |
| 3.792000000000005 | 1 | 1 | 1 |
| 3.796000000000005 | 1 | 1 | 1 |
| 3.800000000000006 | 1 | 1 | 1 |
| 3.804000000000006 | 1 | 1 | 1 |
| 3.808000000000006 | 1 | 1 | 1 |
| 3.812000000000006 | 1 | 1 | 1 |
| 3.816000000000006 | 1 | 1 | 1 |
| 3.820000000000006 | 1 | 1 | 1 |
| 3.824000000000006 | 1 | 1 | 1 |
| 3.828000000000006 | 1 | 1 | 1 |
| 3.832000000000006 | 1 | 1 | 1 |
| 3.836000000000006 | 1 | 1 | 1 |
| 3.840000000000006 | 1 | 1 | 1 |
| 3.844000000000006 | 1 | 1 | 1 |
| 3.848000000000006 | 1 | 1 | 1 |
| 3.852000000000006 | 1 | 1 | 1 |
| 3.856000000000006 | 1 | 1 | 1 |
| 3.860000000000006 | 1 | 1 | 1 |
| 3.864000000000006 | 1 | 1 | 1 |
| 3.868000000000006 | 1 | 1 | 1 |
| 3.872000000000006 | 1 | 1 | 1 |
| 3.876000000000006 | 1 | 1 | 1 |
| 3.880000000000006 | 1 | 1 | 1 |
| 3.884000000000006 | 1 | 1 | 1 |
| 3.888000000000006 | 1 | 1 | 1 |
| 3.892000000000006 | 1 | 1 | 1 |
| 3.896000000000006 | 1 | 1 | 1 |
| 3.900000000000006 | 1 | 1 | 1 |
| 3.904000000000006 | 1 | 1 | 1 |
| 3.908000000000006 | 1 | 1 | 1 |
| 3.912000000000006 | 1 | 1 | 1 |
| 3.916000000000006 | 1 | 1 | 1 |
| 3.920000000000006 | 1 | 1 | 1 |
| 3.924000000000006 | 1 | 1 | 1 |
| 3.928000000000006 | 1 | 1 | 1 |
| 3.932000000000006 | 1 | 1 | 1 |
| 3.936000000000006 | 1 | 1 | 1 |
| 3.940000000000006 | 1 | 1 | 1 |
| 3.944000000000006 | 1 | 1 | 1 |
| 3.948000000000006 | 1 | 1 | 1 |
| 3.952000000000006 | 1 | 1 | 1 |
| 3.956000000000006 | 1 | 1 | 1 |
| 3.960000000000006 | 1 | 1 | 1 |
| 3.964000000000006 | 1 | 1 | 1 |
| 3.968000000000006 | 1 | 1 | 1 |
| 3.972000000000006 | 1 | 1 | 1 |
| 3.976000000000006 | 1 | 1 | 1 |
| 3.980000000000006 | 1 | 1 | 1 |
| 3.984000000000006 | 1 | 1 | 1 |
| 3.988000000000006 | 1 | 1 | 1 |
| 3.992000000000006 | 1 | 1 | 1 |
| 3.996000000000006 | 1 | 1 | 1 |
| 4.000000000000005 | 1 | 1 | 1 |
| 4.004000000000005 | 1 | 1 | 1 |
| 4.008000000000004 | 1 | 1 | 1 |
| 4.012000000000004 | 1 | 1 | 1 |
| 4.016000000000004 | 1 | 1 | 1 |
| 4.020000000000003 | 1 | 1 | 1 |
| 4.024000000000003 | 1 | 1 | 1 |
| 4.028000000000002 | 1 | 1 | 1 |
| 4.032000000000002 | 1 | 1 | 1 |
| 4.036000000000001 | 1 | 1 | 1 |
| 4.040000000000001 | 1 | 1 | 1 |
| 4.044 | 1 | 1 | 1 |
| 4.048 | 1 | 1 | 1 |
| 4.052 | 1 | 1 | 1 |
| 4.055999999999999 | 1 | 1 | 1 |
| 4.059999999999999 | 1 | 1 | 1 |
| 4.063999999999998 | 1 | 1 | 1 |
| 4.067999999999998 | 1 | 1 | 1 |
| 4.071999999999997 | 1 | 1 | 1 |
| 4.075999999999997 | 1 | 1 | 1 |
| 4.079999999999996 | 1 | 1 | 1 |
| 4.083999999999996 | 1 | 1 | 1 |
| 4.087999999999996 | 1 | 1 | 1 |
| 4.091999999999995 | 1 | 1 | 1 |
| 4.095999999999995 | 1 | 1 | 1 |
| 4.099999999999994 | 1 | 1 | 1 |
| 4.103999999999994 | 1 | 1 | 1 |
| 4.107999999999993 | 1 | 1 | 1 |
| 4.111999999999993 | 1 | 1 | 1 |
| 4.115999999999993 | 1 | 1 | 1 |
| 4.119999999999992 | 1 | 1 | 1 |
| 4.123999999999992 | 1 | 1 | 1 |
| 4.127999999999991 | 1 | 1 | 1 |
| 4.131999999999991 | 1 | 1 | 1 |
| 4.13599999999999 | 1 | 1 | 1 |
| 4.13999999999999 | 1 | 1 | 1 |
| 4.143999999999989 | 1 | 1 | 1 |
| 4.147999999999989 | 1 | 1 | 1 |
| 4.151999999999989 | 1 | 1 | 1 |
| 4.155999999999988 | 1 | 1 | 1 |
| 4.159999999999988 | 1 | 1 | 1 |
| 4.163999999999987 | 1 | 1 | 1 |
| 4.167999999999987 | 1 | 1 | 1 |
| 4.171999999999986 | 1 | 1 | 1 |
| 4.175999999999986 | 1 | 1 | 1 |
| 4.179999999999985 | 1 | 1 | 1 |
| 4.183999999999985 | 1 | 1 | 1 |
| 4.187999999999985 | 1 | 1 | 1 |
| 4.191999999999984 | 1 | 1 | 1 |
| 4.195999999999984 | 1 | 1 | 1 |
| 4.199999999999983 | 1 | 1 | 1 |
| 4.203999999999983 | 1 | 1 | 1 |
| 4.207999999999982 | 1 | 1 | 1 |
| 4.211999999999982 | 1 | 1 | 1 |
| 4.215999999999982 | 1 | 1 | 1 |
| 4.219999999999981 | 1 | 1 | 1 |
| 4.223999999999981 | 1 | 1 | 1 |
| 4.22799999999998 | 1 | 1 | 1 |
| 4.23199999999998 | 1 | 1 | 1 |
| 4.23599999999998 | 1 | 1 | 1 |
| 4.239999999999978 | 1 | 1 | 1 |
| 4.243999999999978 | 1 | 1 | 1 |
| 4.247999999999978 | 1 | 1 | 1 |
| 4.251999999999977 | 1 | 1 | 1 |
| 4.255999999999977 | 1 | 1 | 1 |
| 4.259999999999976 | 1 | 1 | 1 |
| 4.263999999999976 | 1 | 1 | 1 |
| 4.267999999999976 | 1 | 1 | 1 |
| 4.271999999999975 | 1 | 1 | 1 |
| 4.275999999999974 | 1 | 1 | 1 |
| 4.279999999999974 | 1 | 1 | 1 |
| 4.283999999999974 | 1 | 1 | 1 |
| 4.287999999999974 | 1 | 1 | 1 |
| 4.291999999999973 | 1 | 1 | 1 |
| 4.295999999999973 | 1 | 1 | 1 |
| 4.299999999999972 | 1 | 1 | 1 |
| 4.303999999999972 | 1 | 1 | 1 |
| 4.307999999999971 | 1 | 1 | 1 |
| 4.311999999999971 | 1 | 1 | 1 |
| 4.31599999999997 | 1 | 1 | 1 |
| 4.31999999999997 | 1 | 1 | 1 |
| 4.32399999999997 | 1 | 1 | 1 |
| 4.327999999999969 | 1 | 1 | 1 |
| 4.331999999999968 | 1 | 1 | 1 |
| 4.335999999999968 | 1 | 1 | 1 |
| 4.339999999999967 | 1 | 1 | 1 |
| 4.343999999999967 | 1 | 1 | 1 |
| 4.347999999999967 | 1 | 1 | 1 |
| 4.351999999999966 | 1 | 1 | 1 |
| 4.355999999999966 | 1 | 1 | 1 |
| 4.359999999999965 | 1 | 1 | 1 |
| 4.363999999999965 | 1 | 1 | 1 |
| 4.367999999999965 | 1 | 1 | 1 |
| 4.371999999999964 | 1 | 1 | 1 |
| 4.375999999999964 | 1 | 1 | 1 |
| 4.379999999999963 | 1 | 1 | 1 |
| 4.383999999999963 | 1 | 1 | 1 |
| 4.387999999999963 | 1 | 1 | 1 |
| 4.391999999999962 | 1 | 1 | 1 |
| 4.395999999999962 | 1 | 1 | 1 |
| 4.399999999999961 | 1 | 1 | 1 |
| 4.40399999999996 | 1 | 1 | 1 |
| 4.40799999999996 | 1 | 1 | 1 |
| 4.41199999999996 | 1 | 1 | 1 |
| 4.415999999999959 | 1 | 1 | 1 |
| 4.41999999999996 | 1 | 1 | 1 |
| 4.423999999999959 | 1 | 1 | 1 |
| 4.427999999999958 | 1 | 1 | 1 |
| 4.431999999999957 | 1 | 1 | 1 |
| 4.435999999999957 | 1 | 1 | 1 |
| 4.439999999999956 | 1 | 1 | 1 |
| 4.443999999999956 | 1 | 1 | 1 |
| 4.447999999999956 | 1 | 1 | 1 |
| 4.451999999999955 | 1 | 1 | 1 |
| 4.455999999999955 | 1 | 1 | 1 |
| 4.459999999999954 | 1 | 1 | 1 |
| 4.463999999999954 | 1 | 1 | 1 |
| 4.467999999999954 | 1 | 1 | 1 |
| 4.471999999999953 | 1 | 1 | 1 |
| 4.475999999999953 | 1 | 1 | 1 |
| 4.479999999999952 | 1 | 1 | 1 |
| 4.483999999999952 | 1 | 1 | 1 |
| 4.487999999999952 | 1 | 1 | 1 |
| 4.491999999999951 | 1 | 1 | 1 |
| 4.495999999999951 | 1 | 1 | 1 |
| 4.49999999999995 | 1 | 1 | 1 |
| 4.50399999999995 | 1 | 1 | 1 |
| 4.507999999999949 | 1 | 1 | 1 |
| 4.511999999999949 | 1 | 1 | 1 |
| 4.515999999999948 | 1 | 1 | 1 |
| 4.519999999999948 | 1 | 1 | 1 |
| 4.523999999999948 | 1 | 1 | 1 |
| 4.527999999999947 | 1 | 1 | 1 |
| 4.531999999999946 | 1 | 1 | 1 |
| 4.535999999999946 | 1 | 1 | 1 |
| 4.539999999999945 | 1 | 1 | 1 |
| 4.543999999999945 | 1 | 1 | 1 |
| 4.547999999999945 | 1 | 1 | 1 |
| 4.551999999999944 | 1 | 1 | 1 |
| 4.555999999999944 | 1 | 1 | 1 |
| 4.559999999999944 | 1 | 1 | 1 |
| 4.563999999999943 | 1 | 1 | 1 |
| 4.567999999999943 | 1 | 1 | 1 |
| 4.571999999999942 | 1 | 1 | 1 |
| 4.575999999999942 | 1 | 1 | 1 |
| 4.579999999999941 | 1 | 1 | 1 |
| 4.583999999999941 | 1 | 1 | 1 |
| 4.587999999999941 | 1 | 1 | 1 |
| 4.59199999999994 | 1 | 1 | 1 |
| 4.59599999999994 | 1 | 1 | 1 |
| 4.59999999999994 | 1 | 1 | 1 |
| 4.603999999999939 | 1 | 1 | 1 |
| 4.607999999999938 | 1 | 1 | 1 |
| 4.611999999999938 | 1 | 1 | 1 |
| 4.615999999999937 | 1 | 1 | 1 |
| 4.619999999999937 | 1 | 1 | 1 |
| 4.623999999999937 | 1 | 1 | 1 |
| 4.627999999999936 | 1 | 1 | 1 |
| 4.631999999999935 | 1 | 1 | 1 |
| 4.635999999999935 | 1 | 1 | 1 |
| 4.639999999999934 | 1 | 1 | 1 |
| 4.643999999999934 | 1 | 1 | 1 |
| 4.647999999999934 | 1 | 1 | 1 |
| 4.651999999999933 | 1 | 1 | 1 |
| 4.655999999999933 | 1 | 1 | 1 |
| 4.659999999999933 | 1 | 1 | 1 |
| 4.663999999999932 | 1 | 1 | 1 |
| 4.667999999999932 | 1 | 1 | 1 |
| 4.671999999999931 | 1 | 1 | 1 |
| 4.675999999999931 | 1 | 1 | 1 |
| 4.67999999999993 | 1 | 1 | 1 |
| 4.68399999999993 | 1 | 1 | 1 |
| 4.687999999999929 | 1 | 1 | 1 |
| 4.69199999999993 | 1 | 1 | 1 |
| 4.695999999999929 | 1 | 1 | 1 |
| 4.699999999999928 | 1 | 1 | 1 |
| 4.703999999999927 | 1 | 1 | 1 |
| 4.707999999999927 | 1 | 1 | 1 |
| 4.711999999999926 | 1 | 1 | 1 |
| 4.715999999999926 | 1 | 1 | 1 |
| 4.719999999999925 | 1 | 1 | 1 |
| 4.723999999999925 | 1 | 1 | 1 |
| 4.727999999999925 | 1 | 1 | 1 |
| 4.731999999999924 | 1 | 1 | 1 |
| 4.735999999999924 | 1 | 1 | 1 |
| 4.739999999999923 | 1 | 1 | 1 |
| 4.743999999999923 | 1 | 1 | 1 |
| 4.747999999999923 | 1 | 1 | 1 |
| 4.751999999999922 | 1 | 1 | 1 |
| 4.755999999999922 | 1 | 1 | 1 |
| 4.759999999999921 | 1 | 1 | 1 |
| 4.763999999999921 | 1 | 1 | 1 |
| 4.767999999999921 | 1 | 1 | 1 |
| 4.77199999999992 | 1 | 1 | 1 |
| 4.77599999999992 | 1 | 1 | 1 |
| 4.77999999999992 | 1 | 1 | 1 |
| 4.783999999999919 | 1 | 1 | 1 |
| 4.787999999999918 | 1 | 1 | 1 |
| 4.791999999999918 | 1 | 1 | 1 |
| 4.795999999999918 | 1 | 1 | 1 |
| 4.799999999999917 | 1 | 1 | 1 |
| 4.803999999999917 | 1 | 1 | 1 |
| 4.807999999999916 | 1 | 1 | 1 |
| 4.811999999999916 | 1 | 1 | 1 |
| 4.815999999999915 | 1 | 1 | 1 |
| 4.819999999999915 | 1 | 1 | 1 |
| 4.823999999999915 | 1 | 1 | 1 |
| 4.827999999999914 | 1 | 1 | 1 |
| 4.831999999999914 | 1 | 1 | 1 |
| 4.835999999999913 | 1 | 1 | 1 |
| 4.839999999999913 | 1 | 1 | 1 |
| 4.843999999999912 | 1 | 1 | 1 |
| 4.847999999999912 | 1 | 1 | 1 |
| 4.851999999999911 | 1 | 1 | 1 |
| 4.855999999999911 | 1 | 1 | 1 |
| 4.859999999999911 | 1 | 1 | 1 |
| 4.86399999999991 | 1 | 1 | 1 |
| 4.86799999999991 | 1 | 1 | 1 |
| 4.87199999999991 | 1 | 1 | 1 |
| 4.875999999999909 | 1 | 1 | 1 |
| 4.879999999999908 | 1 | 1 | 1 |
| 4.883999999999908 | 1 | 1 | 1 |
| 4.887999999999907 | 1 | 1 | 1 |
| 4.891999999999907 | 1 | 1 | 1 |
| 4.895999999999907 | 1 | 1 | 1 |
| 4.899999999999906 | 1 | 1 | 1 |
| 4.903999999999905 | 1 | 1 | 1 |
| 4.907999999999905 | 1 | 1 | 1 |
| 4.911999999999904 | 1 | 1 | 1 |
| 4.915999999999904 | 1 | 1 | 1 |
| 4.919999999999904 | 1 | 1 | 1 |
| 4.923999999999904 | 1 | 1 | 1 |
| 4.927999999999903 | 1 | 1 | 1 |
| 4.931999999999902 | 1 | 1 | 1 |
| 4.935999999999902 | 1 | 1 | 1 |
| 4.939999999999901 | 1 | 1 | 1 |
| 4.943999999999901 | 1 | 1 | 1 |
| 4.947999999999901 | 1 | 1 | 1 |
| 4.9519999999999 | 1 | 1 | 1 |
| 4.9559999999999 | 1 | 1 | 1 |
| 4.9599999999999 | 1 | 1 | 1 |
| 4.9639999999999 | 1 | 1 | 1 |
| 4.967999999999899 | 1 | 1 | 1 |
| 4.971999999999898 | 1 | 1 | 1 |
| 4.975999999999897 | 1 | 1 | 1 |
| 4.979999999999897 | 1 | 1 | 1 |
| 4.983999999999896 | 1 | 1 | 1 |
| 4.987999999999896 | 1 | 1 | 1 |
| 4.991999999999896 | 1 | 1 | 1 |
| 4.995999999999895 | 1 | 1 | 1 |
| 4.999999999999895 | 1 | 1 | 1 |